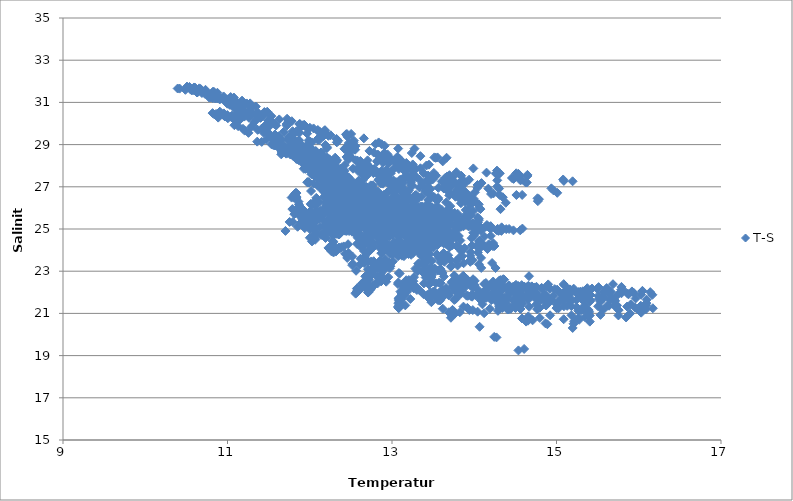
| Category | T-S |
|---|---|
| 13.409 | 22.701 |
| 13.572 | 22.458 |
| 13.0838 | 22.913 |
| 12.903 | 23.056 |
| 12.7436 | 23.09 |
| 12.7075 | 23.091 |
| 12.6064 | 23.305 |
| 12.7715 | 23.364 |
| 12.6666 | 23.673 |
| 12.694 | 23.87 |
| 12.2824 | 24.246 |
| 12.5763 | 24.289 |
| 12.8362 | 23.158 |
| 12.8644 | 22.871 |
| 12.82 | 22.744 |
| 12.7036 | 22.758 |
| 12.563 | 23.02 |
| 12.5159 | 23.287 |
| 12.5223 | 23.356 |
| 12.1682 | 24.832 |
| 12.0637 | 25.35 |
| 12.0056 | 25.59 |
| 11.9125 | 25.921 |
| 11.8768 | 26.061 |
| 11.8678 | 26.167 |
| 11.8635 | 26.295 |
| 11.8381 | 26.476 |
| 11.8307 | 26.556 |
| 11.8083 | 26.607 |
| 11.839 | 26.704 |
| 11.8273 | 26.706 |
| 11.8356 | 26.468 |
| 11.8375 | 26.52 |
| 11.7795 | 26.489 |
| 11.8226 | 26.678 |
| 11.8093 | 26.482 |
| 12.0367 | 25.236 |
| 11.9901 | 25.272 |
| 11.9508 | 25.2 |
| 11.9398 | 25.04 |
| 12.0069 | 24.974 |
| 12.139 | 24.717 |
| 12.1918 | 24.574 |
| 12.2875 | 24.39 |
| 12.4124 | 24.175 |
| 12.4712 | 23.872 |
| 12.6187 | 23.588 |
| 12.6915 | 23.533 |
| 12.8362 | 23.319 |
| 13.3268 | 23.073 |
| 12.855 | 23.5 |
| 12.7112 | 23.453 |
| 12.6486 | 23.594 |
| 12.7772 | 23.473 |
| 12.8844 | 23.348 |
| 12.4559 | 23.628 |
| 12.5179 | 23.699 |
| 12.4301 | 23.824 |
| 12.3174 | 23.931 |
| 12.2892 | 23.888 |
| 12.2645 | 23.939 |
| 12.2272 | 24.102 |
| 12.0661 | 24.49 |
| 12.0274 | 24.411 |
| 12.0654 | 24.57 |
| 12.0501 | 24.685 |
| 12.0012 | 24.584 |
| 12.0688 | 24.884 |
| 12.0643 | 25.09 |
| 12.045 | 25.094 |
| 12.0593 | 25.646 |
| 12.0115 | 25.751 |
| 12.0084 | 25.839 |
| 12.0121 | 25.868 |
| 12.0154 | 26.156 |
| 12.0129 | 26.192 |
| 12.0367 | 26.217 |
| 12.0601 | 26.108 |
| 12.0728 | 26.196 |
| 12.0963 | 26.214 |
| 12.0963 | 26.3 |
| 12.1086 | 26.259 |
| 12.1987 | 26.262 |
| 12.2252 | 26.249 |
| 12.2954 | 25.29 |
| 12.4591 | 25.188 |
| 12.6641 | 25.055 |
| 12.8027 | 24.792 |
| 13.0767 | 24.889 |
| 12.8708 | 24.772 |
| 13.0058 | 24.717 |
| 13.0937 | 24.453 |
| 13.2402 | 24.041 |
| 13.2675 | 24.233 |
| 13.5831 | 23.657 |
| 13.7805 | 23.483 |
| 13.954 | 23.531 |
| 13.8544 | 23.716 |
| 13.9545 | 23.901 |
| 13.6991 | 24.135 |
| 14.0431 | 23.886 |
| 13.8446 | 23.941 |
| 13.9529 | 23.732 |
| 13.9798 | 23.52 |
| 14.0579 | 23.325 |
| 13.8198 | 23.648 |
| 13.57 | 23.628 |
| 13.8714 | 23.379 |
| 13.6184 | 23.521 |
| 13.3999 | 23.879 |
| 13.5029 | 24.128 |
| 13.6584 | 24.289 |
| 13.8018 | 24.144 |
| 13.4634 | 24.073 |
| 13.2772 | 24.07 |
| 13.3752 | 24.047 |
| 12.9085 | 24.828 |
| 12.7434 | 25.084 |
| 12.4664 | 25.694 |
| 12.2495 | 26.205 |
| 12.2199 | 26.25 |
| 12.166 | 26.489 |
| 12.1891 | 26.589 |
| 12.1731 | 26.951 |
| 12.1782 | 27.193 |
| 12.1823 | 27.435 |
| 12.1573 | 27.35 |
| 12.1464 | 27.522 |
| 12.0897 | 27.674 |
| 12.0826 | 28.141 |
| 12.0743 | 28.04 |
| 12.0743 | 27.923 |
| 12.0207 | 27.593 |
| 12.0307 | 27.794 |
| 12.0993 | 27.624 |
| 12.521 | 25.625 |
| 12.4264 | 25.455 |
| 12.4159 | 25.756 |
| 12.5065 | 25.307 |
| 12.509 | 25.351 |
| 12.5445 | 25.276 |
| 12.7227 | 24.927 |
| 13.1159 | 24.231 |
| 13.6274 | 23.858 |
| 14.083 | 23.63 |
| 14.2171 | 23.388 |
| 13.9516 | 23.445 |
| 13.5439 | 23.803 |
| 13.3075 | 24.108 |
| 13.3603 | 24.001 |
| 13.4058 | 23.915 |
| 13.3403 | 24.016 |
| 13.3509 | 23.981 |
| 13.2818 | 24.105 |
| 13.1695 | 24.284 |
| 13.2977 | 24.046 |
| 13.352 | 23.92 |
| 13.2012 | 23.813 |
| 13.1453 | 23.713 |
| 13.0993 | 23.805 |
| 12.7692 | 24.134 |
| 12.7688 | 24.126 |
| 12.8494 | 24.114 |
| 12.6836 | 24.343 |
| 12.856 | 24.703 |
| 12.7524 | 24.937 |
| 12.7242 | 24.755 |
| 12.6186 | 25.209 |
| 12.5089 | 25.594 |
| 12.6331 | 25.236 |
| 12.4211 | 26.025 |
| 12.3688 | 26.321 |
| 12.3643 | 26.343 |
| 12.3284 | 26.515 |
| 12.3202 | 26.697 |
| 12.2262 | 27.008 |
| 12.1902 | 27.206 |
| 12.199 | 27.29 |
| 12.181 | 27.372 |
| 12.3162 | 27.348 |
| 12.3308 | 27.412 |
| 12.3472 | 27.358 |
| 12.37 | 27.331 |
| 12.3191 | 27.4 |
| 12.9522 | 25.401 |
| 13.0083 | 25.428 |
| 12.9715 | 25.498 |
| 13.1584 | 25.49 |
| 13.3809 | 25.256 |
| 13.4217 | 25.546 |
| 13.4759 | 25.281 |
| 13.7803 | 24.718 |
| 14.0576 | 24.43 |
| 14.2278 | 24.184 |
| 14.2458 | 24.194 |
| 14.2298 | 24.331 |
| 14.1232 | 24.641 |
| 14.0803 | 24.914 |
| 14.2845 | 25.008 |
| 14.3886 | 24.994 |
| 14.0775 | 24.121 |
| 14.1752 | 24.272 |
| 14.1855 | 24.226 |
| 14.1016 | 24.234 |
| 13.9714 | 24.213 |
| 13.7837 | 24.202 |
| 13.7297 | 24.225 |
| 13.8311 | 24.456 |
| 14.2017 | 24.674 |
| 13.4125 | 24.682 |
| 13.2257 | 24.918 |
| 13.4931 | 24.875 |
| 13.7298 | 24.513 |
| 13.5809 | 24.718 |
| 13.1944 | 25.557 |
| 13.3599 | 25 |
| 13.2177 | 25.262 |
| 12.5254 | 26.655 |
| 12.4851 | 26.764 |
| 12.3509 | 27.158 |
| 12.3091 | 27.406 |
| 12.2392 | 27.623 |
| 12.1757 | 27.929 |
| 12.1757 | 28.071 |
| 12.1566 | 28.251 |
| 12.0495 | 28.652 |
| 11.8934 | 28.922 |
| 11.7914 | 29.138 |
| 11.7335 | 29.246 |
| 11.867 | 28.92 |
| 11.8678 | 28.958 |
| 11.8932 | 28.732 |
| 11.9965 | 28.692 |
| 12.7379 | 26.354 |
| 12.548 | 26.621 |
| 12.5992 | 26.511 |
| 12.6339 | 26.462 |
| 12.7179 | 26.137 |
| 12.7649 | 26.05 |
| 12.7571 | 26.013 |
| 13.0163 | 25.417 |
| 13.3473 | 24.767 |
| 13.7029 | 24.261 |
| 13.882 | 24.094 |
| 13.8191 | 24.125 |
| 13.4586 | 24.761 |
| 13.3855 | 24.905 |
| 13.5757 | 24.604 |
| 13.4717 | 24.435 |
| 13.4442 | 24.52 |
| 13.6241 | 23.584 |
| 13.3572 | 24.446 |
| 13.4112 | 24.198 |
| 13.4333 | 23.96 |
| 13.3761 | 24.06 |
| 13.7081 | 23.533 |
| 13.6835 | 23.754 |
| 13.4479 | 23.788 |
| 13.3734 | 23.78 |
| 13.3728 | 23.955 |
| 13.4395 | 24.026 |
| 13.3034 | 24.234 |
| 13.0813 | 24.662 |
| 13.237 | 24.6 |
| 13.2712 | 24.545 |
| 13.0789 | 24.89 |
| 12.93 | 25.393 |
| 12.7942 | 25.748 |
| 12.7315 | 25.972 |
| 12.6768 | 26.181 |
| 12.5413 | 26.674 |
| 12.4646 | 26.946 |
| 12.4267 | 27.07 |
| 12.3032 | 27.407 |
| 12.1772 | 27.681 |
| 12.0595 | 27.975 |
| 12.04 | 28.1 |
| 11.933 | 28.335 |
| 12.0095 | 28.297 |
| 12.0291 | 28.268 |
| 12.2607 | 27.91 |
| 12.2716 | 28 |
| 12.2266 | 28.125 |
| 12.3743 | 27.787 |
| 12.9617 | 25.961 |
| 13.092 | 25.729 |
| 13.2128 | 25.731 |
| 13.3432 | 25.488 |
| 13.3972 | 25.706 |
| 13.4955 | 25.545 |
| 13.6529 | 25.13 |
| 13.8125 | 24.667 |
| 14.0242 | 24.199 |
| 14.161 | 24.049 |
| 14.1239 | 24.211 |
| 14.0627 | 24.435 |
| 13.9869 | 24.822 |
| 14.0452 | 25.017 |
| 14.0666 | 25.081 |
| 14.0107 | 25.11 |
| 13.9323 | 25.119 |
| 14.0089 | 24.793 |
| 13.997 | 24.684 |
| 13.9678 | 24.563 |
| 13.7782 | 24.594 |
| 13.4758 | 24.641 |
| 13.5906 | 24.74 |
| 13.5024 | 24.885 |
| 13.4717 | 25.043 |
| 13.3834 | 25.142 |
| 13.5734 | 25.46 |
| 13.6187 | 24.985 |
| 13.4312 | 25.315 |
| 13.1702 | 25.873 |
| 13.0772 | 25.945 |
| 12.4745 | 27.16 |
| 12.297 | 27.586 |
| 12.2598 | 27.73 |
| 12.2089 | 27.905 |
| 12.1334 | 28.092 |
| 12.0553 | 28.298 |
| 11.9881 | 28.508 |
| 11.929 | 28.719 |
| 11.8539 | 28.936 |
| 11.7736 | 29.034 |
| 11.5768 | 29.48 |
| 11.4886 | 29.592 |
| 11.626 | 29.345 |
| 11.6221 | 29.393 |
| 11.6615 | 29.214 |
| 11.7812 | 28.994 |
| 12.4483 | 27.011 |
| 12.2641 | 27.325 |
| 12.2696 | 27.3 |
| 12.3793 | 26.948 |
| 12.4008 | 26.752 |
| 12.5665 | 26.426 |
| 12.6661 | 26.102 |
| 12.7516 | 25.666 |
| 13.1284 | 24.793 |
| 13.3222 | 24.626 |
| 12.9885 | 25.703 |
| 13.0122 | 25.509 |
| 12.9391 | 25.543 |
| 13.205 | 25.187 |
| 13.1422 | 25.134 |
| 13.184 | 24.684 |
| 13.0071 | 25.323 |
| 13.2377 | 24.379 |
| 13.3209 | 23.884 |
| 13.2133 | 24.122 |
| 13.2162 | 24.16 |
| 13.1848 | 24.282 |
| 13.201 | 24.171 |
| 13.2564 | 23.862 |
| 13.33 | 23.37 |
| 13.2332 | 23.777 |
| 13.1806 | 23.838 |
| 13.207 | 23.851 |
| 13.1988 | 23.864 |
| 13.1539 | 24.073 |
| 13.0919 | 24.41 |
| 13.1073 | 24.302 |
| 12.9642 | 24.857 |
| 12.8741 | 25.252 |
| 12.9032 | 25.218 |
| 12.8202 | 25.522 |
| 12.7364 | 25.928 |
| 12.5946 | 26.407 |
| 12.4445 | 26.849 |
| 12.3664 | 27.068 |
| 12.0648 | 27.763 |
| 12.077 | 27.762 |
| 11.8375 | 28.32 |
| 11.7277 | 28.6 |
| 11.6672 | 28.709 |
| 11.6729 | 28.742 |
| 11.652 | 28.865 |
| 11.563 | 29.084 |
| 11.6349 | 28.983 |
| 11.6975 | 28.934 |
| 11.6973 | 28.865 |
| 12.6698 | 26.292 |
| 12.7644 | 26.118 |
| 12.762 | 26.298 |
| 12.8774 | 26.075 |
| 13.0227 | 25.757 |
| 13.0127 | 25.913 |
| 13.0499 | 25.886 |
| 13.328 | 25.187 |
| 13.407 | 24.929 |
| 13.528 | 24.532 |
| 13.6291 | 24.319 |
| 13.6251 | 24.472 |
| 13.6186 | 24.703 |
| 13.6319 | 24.87 |
| 13.516 | 25.315 |
| 13.6286 | 25.172 |
| 13.612 | 25.191 |
| 13.4317 | 25.313 |
| 13.5692 | 25.236 |
| 13.5968 | 25.2 |
| 13.5179 | 24.492 |
| 13.435 | 24.525 |
| 13.4045 | 24.555 |
| 13.294 | 24.635 |
| 13.464 | 24.906 |
| 13.2622 | 25.07 |
| 13.1629 | 25.243 |
| 13.2407 | 25.781 |
| 12.9994 | 25.727 |
| 12.9114 | 26.043 |
| 12.8021 | 26.205 |
| 12.2882 | 27.212 |
| 12.1438 | 27.668 |
| 11.9446 | 28.297 |
| 11.8377 | 28.568 |
| 11.6277 | 29.119 |
| 11.4426 | 29.548 |
| 11.2862 | 29.826 |
| 11.1141 | 30.122 |
| 11.0816 | 30.184 |
| 11.0044 | 30.3 |
| 10.9544 | 30.382 |
| 10.9152 | 30.438 |
| 10.8997 | 30.472 |
| 10.9014 | 30.468 |
| 10.9689 | 30.337 |
| 11.0045 | 30.248 |
| 12.2066 | 27.347 |
| 12.0341 | 27.82 |
| 11.9605 | 28.057 |
| 11.9987 | 27.921 |
| 12.1301 | 27.482 |
| 12.2242 | 27.253 |
| 12.496 | 26.476 |
| 12.7478 | 25.616 |
| 12.9054 | 25.007 |
| 12.7958 | 24.999 |
| 12.7896 | 25.172 |
| 12.6334 | 26.06 |
| 12.607 | 25.848 |
| 12.4204 | 26.217 |
| 12.7827 | 25.074 |
| 12.8031 | 25.053 |
| 12.9183 | 24.375 |
| 12.8657 | 24.633 |
| 12.8601 | 24.294 |
| 12.8913 | 24.22 |
| 12.8552 | 24.408 |
| 12.9163 | 24.027 |
| 12.8965 | 24.071 |
| 12.9085 | 24.019 |
| 12.9756 | 23.828 |
| 13.0534 | 23.823 |
| 13.1085 | 23.858 |
| 13.0399 | 23.963 |
| 12.9573 | 24.048 |
| 12.9637 | 24.228 |
| 12.847 | 24.827 |
| 12.9028 | 24.542 |
| 12.6796 | 25.549 |
| 12.6546 | 25.596 |
| 12.703 | 25.502 |
| 12.6033 | 25.867 |
| 12.5389 | 26.263 |
| 12.3506 | 26.865 |
| 12.2145 | 27.264 |
| 12.0956 | 27.616 |
| 11.6535 | 28.538 |
| 11.6574 | 28.653 |
| 11.4164 | 29.128 |
| 11.6851 | 28.742 |
| 11.255 | 29.556 |
| 11.0837 | 29.919 |
| 10.8868 | 30.279 |
| 10.8422 | 30.426 |
| 10.8184 | 30.493 |
| 10.8609 | 30.452 |
| 10.9684 | 30.33 |
| 11.0877 | 30.223 |
| 11.1205 | 30.163 |
| 12.5768 | 26.714 |
| 12.7019 | 26.67 |
| 12.7751 | 26.686 |
| 12.7419 | 26.855 |
| 12.9399 | 26.733 |
| 13.0293 | 26.6 |
| 13.4598 | 25.77 |
| 13.6478 | 25.332 |
| 13.7544 | 25.137 |
| 13.8398 | 25.109 |
| 13.3189 | 26.019 |
| 13.1621 | 26.4 |
| 13.2735 | 26.386 |
| 13.2935 | 26.348 |
| 13.2728 | 26.391 |
| 13.3719 | 25.784 |
| 13.4675 | 25.636 |
| 13.4922 | 25.56 |
| 13.427 | 25.657 |
| 13.412 | 25.646 |
| 13.307 | 25.014 |
| 13.1271 | 25.414 |
| 13.0499 | 25.576 |
| 12.9517 | 25.77 |
| 12.6308 | 26.326 |
| 13.094 | 26.227 |
| 12.9773 | 26.338 |
| 12.6305 | 26.846 |
| 12.3516 | 27.605 |
| 12.153 | 27.33 |
| 11.9126 | 28.115 |
| 11.6893 | 28.877 |
| 11.5852 | 29.147 |
| 11.4873 | 29.552 |
| 11.4159 | 29.76 |
| 11.3073 | 29.909 |
| 11.144 | 30.156 |
| 11.0601 | 30.297 |
| 10.9979 | 30.401 |
| 10.9551 | 30.479 |
| 10.9059 | 30.552 |
| 10.9051 | 30.551 |
| 10.9051 | 30.551 |
| 11.2085 | 29.663 |
| 11.1295 | 29.874 |
| 11.1883 | 29.75 |
| 11.3615 | 29.141 |
| 11.9494 | 27.85 |
| 12.0246 | 27.762 |
| 11.9276 | 27.855 |
| 11.9683 | 27.875 |
| 11.9846 | 27.906 |
| 12.277 | 27.01 |
| 12.5823 | 26.035 |
| 12.5683 | 25.706 |
| 12.4094 | 26.456 |
| 12.4386 | 26.232 |
| 12.3549 | 26.462 |
| 12.3486 | 26.464 |
| 12.2743 | 26.467 |
| 12.1799 | 26.829 |
| 12.3708 | 26.062 |
| 12.6123 | 25.463 |
| 12.5039 | 25.819 |
| 12.5577 | 25.633 |
| 12.6445 | 25.354 |
| 12.6659 | 25.238 |
| 12.6274 | 25.23 |
| 12.663 | 25.023 |
| 12.7472 | 24.629 |
| 12.9418 | 24.232 |
| 13.0478 | 24.22 |
| 13.1049 | 24.235 |
| 13.0231 | 24.358 |
| 13.0584 | 24.429 |
| 12.9783 | 24.707 |
| 12.8358 | 25.01 |
| 12.6526 | 25.707 |
| 12.5977 | 25.861 |
| 12.5426 | 26.009 |
| 12.558 | 26.135 |
| 12.3586 | 26.719 |
| 12.4146 | 26.72 |
| 12.1821 | 27.371 |
| 12.1057 | 27.694 |
| 11.7993 | 28.458 |
| 11.9175 | 28.484 |
| 11.4727 | 29.237 |
| 11.5308 | 29.334 |
| 11.3668 | 29.699 |
| 11.1154 | 30.087 |
| 11.0496 | 30.291 |
| 11.0515 | 30.364 |
| 11.0662 | 30.364 |
| 11.0952 | 30.349 |
| 11.1154 | 30.356 |
| 11.1639 | 30.335 |
| 11.1957 | 30.328 |
| 11.2056 | 30.33 |
| 11.4907 | 30.157 |
| 12.3221 | 28.184 |
| 12.4474 | 28.416 |
| 12.5355 | 28.788 |
| 12.941 | 28.201 |
| 13.1874 | 27.948 |
| 13.3461 | 27.878 |
| 13.8394 | 27.189 |
| 14.2044 | 26.66 |
| 14.3834 | 26.243 |
| 13.9965 | 26.421 |
| 13.7871 | 26.804 |
| 13.7991 | 26.866 |
| 13.6436 | 26.927 |
| 13.7078 | 26.956 |
| 13.7613 | 26.62 |
| 13.8681 | 26.582 |
| 13.8608 | 26.544 |
| 13.8512 | 26.545 |
| 13.6594 | 26.259 |
| 13.2353 | 25.994 |
| 13.0763 | 26.07 |
| 12.9998 | 26.209 |
| 13.0126 | 26.528 |
| 12.5234 | 27.241 |
| 13.4245 | 27.319 |
| 13.2182 | 27.445 |
| 12.6585 | 27.55 |
| 12.4258 | 28.026 |
| 12.2399 | 28.305 |
| 11.8687 | 29.212 |
| 11.6839 | 29.606 |
| 11.5916 | 29.904 |
| 11.5312 | 30.129 |
| 11.517 | 30.133 |
| 11.4 | 30.266 |
| 11.2941 | 30.46 |
| 11.1836 | 30.632 |
| 11.1255 | 30.738 |
| 11.1038 | 30.766 |
| 11.085 | 30.784 |
| 11.0664 | 30.789 |
| 11.1858 | 30.563 |
| 11.3459 | 30.175 |
| 11.4611 | 29.919 |
| 11.2652 | 30.473 |
| 11.5099 | 29.871 |
| 12.0584 | 28.647 |
| 12.0238 | 28.784 |
| 12.2096 | 28.398 |
| 12.3322 | 28.262 |
| 12.526 | 27.858 |
| 12.8639 | 27.154 |
| 13.1799 | 26.353 |
| 13.1545 | 26.531 |
| 13.0634 | 27.073 |
| 12.9886 | 27.161 |
| 12.9758 | 27.11 |
| 12.9039 | 27.248 |
| 13.0547 | 26.848 |
| 13.4083 | 25.844 |
| 13.0072 | 26.862 |
| 13.1294 | 26.543 |
| 13.534 | 25.409 |
| 13.4771 | 25.514 |
| 13.5361 | 25.295 |
| 13.5373 | 25.302 |
| 13.5813 | 25.121 |
| 13.5707 | 25.048 |
| 13.6159 | 24.696 |
| 13.655 | 24.344 |
| 13.5946 | 24.375 |
| 13.5337 | 24.459 |
| 13.5346 | 24.621 |
| 13.2892 | 25.27 |
| 13.3995 | 25.01 |
| 13.1555 | 25.7 |
| 13.2446 | 25.63 |
| 13.0645 | 26.149 |
| 13.0364 | 26.21 |
| 12.8641 | 26.605 |
| 12.6889 | 26.994 |
| 12.6001 | 27.313 |
| 12.4108 | 27.803 |
| 12.1822 | 28.413 |
| 11.8697 | 29.026 |
| 11.8642 | 29.185 |
| 11.3247 | 30.068 |
| 11.2607 | 30.272 |
| 11.1675 | 30.463 |
| 11.5363 | 30.054 |
| 11.1237 | 30.572 |
| 11.1419 | 30.549 |
| 11.1959 | 30.551 |
| 11.217 | 30.532 |
| 11.2456 | 30.527 |
| 11.3057 | 30.497 |
| 11.3645 | 30.476 |
| 11.3699 | 30.508 |
| 11.4482 | 30.542 |
| 12.4978 | 28.684 |
| 12.828 | 28.528 |
| 13.1744 | 28.131 |
| 13.2404 | 28.602 |
| 13.3455 | 28.453 |
| 13.4493 | 28.049 |
| 14.088 | 27.176 |
| 14.3019 | 26.916 |
| 14.3088 | 26.614 |
| 13.8351 | 26.992 |
| 13.6982 | 27.27 |
| 13.6433 | 27.243 |
| 13.7547 | 27.239 |
| 13.9372 | 27.337 |
| 13.8706 | 27.295 |
| 13.7302 | 27.185 |
| 13.7768 | 27.133 |
| 14.0084 | 26.741 |
| 13.7715 | 26.53 |
| 13.5212 | 26.462 |
| 13.32 | 26.503 |
| 13.1724 | 26.584 |
| 13.0115 | 27.171 |
| 13.7829 | 27.689 |
| 13.2803 | 27.889 |
| 12.6164 | 28.222 |
| 12.4217 | 28.798 |
| 12.0978 | 29.223 |
| 11.8751 | 29.572 |
| 11.7183 | 29.974 |
| 11.5345 | 30.346 |
| 11.2774 | 30.776 |
| 11.1944 | 30.88 |
| 11.1371 | 30.955 |
| 11.1205 | 30.984 |
| 11.0764 | 31.032 |
| 11.018 | 31.091 |
| 10.9204 | 31.179 |
| 10.8326 | 31.278 |
| 10.7752 | 31.341 |
| 10.9534 | 31.133 |
| 11.0845 | 30.852 |
| 11.1766 | 30.697 |
| 11.068 | 30.999 |
| 11.1179 | 30.852 |
| 12.0245 | 29.104 |
| 11.9862 | 29.195 |
| 12.0052 | 29.141 |
| 12.2073 | 28.825 |
| 12.19 | 28.98 |
| 12.6227 | 28.032 |
| 12.7736 | 27.65 |
| 13.0339 | 26.841 |
| 12.9881 | 26.864 |
| 12.8742 | 27.597 |
| 12.834 | 27.561 |
| 12.7387 | 27.73 |
| 13.1708 | 26.672 |
| 13.0671 | 26.895 |
| 12.9184 | 27.248 |
| 13.2605 | 26.447 |
| 13.4496 | 25.933 |
| 13.4581 | 25.888 |
| 13.5302 | 25.522 |
| 13.5128 | 25.354 |
| 13.5629 | 25.412 |
| 13.5545 | 25.388 |
| 13.5757 | 25.376 |
| 13.6543 | 25.223 |
| 13.7288 | 24.7 |
| 13.7251 | 24.725 |
| 13.6917 | 24.906 |
| 13.6475 | 25.13 |
| 13.3103 | 25.888 |
| 13.474 | 25.583 |
| 13.512 | 25.72 |
| 13.2626 | 26.328 |
| 13.1873 | 26.603 |
| 13.1174 | 26.733 |
| 13.1921 | 26.75 |
| 12.8342 | 27.312 |
| 12.5867 | 27.902 |
| 12.4705 | 28.292 |
| 12.2111 | 28.875 |
| 11.8215 | 29.56 |
| 11.569 | 29.981 |
| 11.4091 | 30.297 |
| 11.0557 | 30.903 |
| 11.1086 | 30.867 |
| 11.3687 | 30.501 |
| 10.9829 | 31.012 |
| 11.0175 | 30.971 |
| 11.0146 | 30.957 |
| 11.0172 | 30.941 |
| 11.059 | 30.916 |
| 11.0578 | 30.921 |
| 11.0712 | 30.915 |
| 11.1387 | 30.914 |
| 11.2753 | 30.953 |
| 12.5344 | 28.853 |
| 12.9008 | 28.491 |
| 12.9097 | 28.586 |
| 13.0942 | 28.317 |
| 13.515 | 28.393 |
| 13.6169 | 28.204 |
| 14.2797 | 27.306 |
| 14.2799 | 27.015 |
| 14.5826 | 26.614 |
| 14.0399 | 27.087 |
| 13.8887 | 27.174 |
| 13.5372 | 27.53 |
| 13.699 | 27.55 |
| 13.7416 | 27.466 |
| 13.6478 | 27.425 |
| 13.8382 | 27.244 |
| 13.8129 | 27.173 |
| 13.79 | 27.104 |
| 13.6284 | 26.934 |
| 13.2311 | 27.078 |
| 13.4473 | 27.217 |
| 13.2946 | 27.466 |
| 12.9338 | 27.802 |
| 13.1283 | 28.046 |
| 12.8191 | 28.196 |
| 12.7033 | 28.254 |
| 12.1687 | 29.412 |
| 11.968 | 29.521 |
| 11.6294 | 30.194 |
| 11.4524 | 30.52 |
| 11.2946 | 30.77 |
| 11.0057 | 31.145 |
| 10.9499 | 31.206 |
| 10.8821 | 31.277 |
| 10.8137 | 31.348 |
| 10.6891 | 31.445 |
| 10.6369 | 31.481 |
| 10.4881 | 31.595 |
| 10.4176 | 31.654 |
| 10.394 | 31.658 |
| 10.6284 | 31.471 |
| 10.6314 | 31.479 |
| 10.9983 | 30.939 |
| 10.7832 | 31.351 |
| 10.9054 | 31.141 |
| 11.7913 | 29.634 |
| 11.8372 | 29.63 |
| 11.8542 | 29.627 |
| 12.1166 | 29.224 |
| 12.101 | 29.279 |
| 12.4822 | 28.497 |
| 12.6997 | 28.068 |
| 13.0452 | 27.19 |
| 12.8938 | 27.511 |
| 12.6865 | 28.054 |
| 12.5551 | 28.257 |
| 12.5794 | 28.244 |
| 12.6717 | 28.05 |
| 12.9238 | 27.518 |
| 12.7182 | 27.96 |
| 12.8452 | 27.672 |
| 13.0204 | 27.296 |
| 13.1224 | 26.987 |
| 13.2039 | 26.826 |
| 13.292 | 26.614 |
| 13.4565 | 26.112 |
| 13.4882 | 26.029 |
| 13.5345 | 25.953 |
| 13.6449 | 25.414 |
| 13.699 | 25.279 |
| 13.675 | 25.323 |
| 13.5917 | 25.538 |
| 13.5267 | 25.745 |
| 13.2183 | 26.365 |
| 13.4202 | 26.161 |
| 13.4438 | 26.37 |
| 13.3594 | 26.537 |
| 13.0499 | 27.22 |
| 12.8767 | 27.446 |
| 13.1088 | 27.337 |
| 12.7863 | 27.855 |
| 12.496 | 28.408 |
| 12.4574 | 28.682 |
| 12.1048 | 29.304 |
| 11.7206 | 29.897 |
| 11.3574 | 30.351 |
| 11.0282 | 30.884 |
| 11.0077 | 31.038 |
| 10.7773 | 31.233 |
| 10.7965 | 31.231 |
| 10.8219 | 31.204 |
| 10.8516 | 31.185 |
| 10.8728 | 31.198 |
| 10.8816 | 31.202 |
| 10.8875 | 31.209 |
| 10.8886 | 31.223 |
| 10.9455 | 31.191 |
| 10.9623 | 31.196 |
| 12.1791 | 29.663 |
| 12.5371 | 29.184 |
| 12.8735 | 29.017 |
| 12.9112 | 28.946 |
| 13.0751 | 28.812 |
| 13.2736 | 28.808 |
| 13.5535 | 28.392 |
| 13.6634 | 28.377 |
| 14.51 | 27.64 |
| 14.4782 | 27.374 |
| 14.9377 | 26.926 |
| 14.9629 | 26.831 |
| 15.009 | 26.715 |
| 14.6388 | 27.203 |
| 14.5795 | 27.326 |
| 14.56 | 27.312 |
| 14.6257 | 27.205 |
| 14.4586 | 27.417 |
| 14.2622 | 27.627 |
| 14.3039 | 27.624 |
| 13.6712 | 27.491 |
| 13.5089 | 27.658 |
| 13.0839 | 27.842 |
| 12.8284 | 28.259 |
| 13.0659 | 28.423 |
| 12.7991 | 29.021 |
| 12.4844 | 28.874 |
| 12.0464 | 29.766 |
| 11.7407 | 30.112 |
| 11.4833 | 30.557 |
| 11.3449 | 30.801 |
| 11.2339 | 30.95 |
| 11.0385 | 31.253 |
| 10.8774 | 31.458 |
| 10.8343 | 31.5 |
| 10.8219 | 31.502 |
| 10.7326 | 31.598 |
| 10.6568 | 31.664 |
| 10.5924 | 31.708 |
| 10.5378 | 31.733 |
| 10.5075 | 31.75 |
| 10.605 | 31.686 |
| 10.6733 | 31.635 |
| 10.6053 | 31.691 |
| 12.3293 | 29.106 |
| 11.9617 | 29.796 |
| 11.8743 | 29.969 |
| 11.9165 | 29.913 |
| 11.8806 | 29.973 |
| 12.163 | 29.567 |
| 12.1192 | 29.618 |
| 12.4745 | 29.074 |
| 12.5554 | 28.928 |
| 12.9981 | 28.282 |
| 13.2394 | 27.841 |
| 12.8988 | 28.574 |
| 12.9544 | 28.436 |
| 12.9179 | 28.522 |
| 13.0686 | 28.162 |
| 12.9 | 28.509 |
| 13.0251 | 28.214 |
| 13.1263 | 28.026 |
| 13.2617 | 27.766 |
| 13.4944 | 27.348 |
| 13.6818 | 26.961 |
| 13.7808 | 26.742 |
| 13.8758 | 26.562 |
| 13.9269 | 26.462 |
| 14.0158 | 26.274 |
| 14.0749 | 25.943 |
| 13.9837 | 25.838 |
| 13.8965 | 25.902 |
| 13.9305 | 25.923 |
| 13.838 | 26.222 |
| 13.4112 | 26.911 |
| 13.6958 | 26.591 |
| 13.3683 | 27.145 |
| 13.5639 | 26.95 |
| 13.1548 | 27.741 |
| 13.1688 | 27.742 |
| 13.0292 | 27.877 |
| 12.8896 | 28.134 |
| 12.552 | 28.759 |
| 12.3455 | 29.181 |
| 12.0973 | 29.646 |
| 11.9327 | 29.941 |
| 11.4653 | 30.494 |
| 11.1919 | 30.847 |
| 10.9569 | 31.155 |
| 10.7243 | 31.41 |
| 10.6177 | 31.529 |
| 10.565 | 31.576 |
| 10.5522 | 31.605 |
| 10.5629 | 31.609 |
| 10.5725 | 31.599 |
| 10.5749 | 31.596 |
| 10.5869 | 31.594 |
| 10.5949 | 31.593 |
| 10.5935 | 31.593 |
| 13.4187 | 28.009 |
| 12.1849 | 29.684 |
| 12.459 | 29.37 |
| 12.4403 | 29.483 |
| 12.4519 | 29.502 |
| 12.5035 | 29.505 |
| 12.6578 | 29.296 |
| 12.8378 | 29.102 |
| 13.5316 | 28.375 |
| 13.9887 | 27.87 |
| 14.1494 | 27.671 |
| 14.3103 | 27.643 |
| 14.6462 | 27.514 |
| 15.0896 | 27.28 |
| 15.1957 | 27.26 |
| 15.081 | 27.346 |
| 14.6462 | 27.566 |
| 14.5365 | 27.615 |
| 14.549 | 27.545 |
| 14.2762 | 27.768 |
| 13.8414 | 27.525 |
| 13.2861 | 27.832 |
| 13.2526 | 28.06 |
| 12.9458 | 28.538 |
| 12.7787 | 28.623 |
| 12.5311 | 29.108 |
| 12.5109 | 29.072 |
| 12.2545 | 29.442 |
| 11.9384 | 29.904 |
| 11.7242 | 30.224 |
| 11.2631 | 30.9 |
| 11.1769 | 31.084 |
| 11.0775 | 31.23 |
| 10.9531 | 31.282 |
| 11.0032 | 31.044 |
| 11.0768 | 30.804 |
| 11.1278 | 30.645 |
| 11.1589 | 30.55 |
| 11.1624 | 30.532 |
| 11.1675 | 30.521 |
| 11.1674 | 30.523 |
| 11.1877 | 30.465 |
| 11.1869 | 30.472 |
| 11.1847 | 30.485 |
| 11.1847 | 30.488 |
| 11.1763 | 30.526 |
| 12.3253 | 29.271 |
| 12.2267 | 29.416 |
| 11.8994 | 29.871 |
| 11.7818 | 30.108 |
| 12.0018 | 29.798 |
| 12.0983 | 29.691 |
| 12.5259 | 28.945 |
| 12.8335 | 28.483 |
| 13.1483 | 28.015 |
| 13.2755 | 27.864 |
| 13.2103 | 27.975 |
| 13.1245 | 28.182 |
| 13.4392 | 27.533 |
| 13.6042 | 27.254 |
| 13.6622 | 27.134 |
| 13.8923 | 26.754 |
| 13.8503 | 26.813 |
| 13.9484 | 26.552 |
| 13.687 | 27.067 |
| 13.842 | 26.724 |
| 13.8611 | 26.622 |
| 13.8977 | 26.528 |
| 13.9183 | 26.502 |
| 14.0549 | 26.168 |
| 13.9746 | 26.206 |
| 13.9433 | 26.192 |
| 13.8877 | 26.291 |
| 13.8199 | 26.445 |
| 13.6922 | 26.742 |
| 13.6305 | 26.918 |
| 13.6408 | 27.012 |
| 13.7113 | 27.023 |
| 13.4886 | 27.413 |
| 13.2428 | 27.757 |
| 13.093 | 28.011 |
| 12.9709 | 28.195 |
| 12.9064 | 28.356 |
| 12.7256 | 28.701 |
| 12.4468 | 28.871 |
| 12.3091 | 28.38 |
| 12.2814 | 28.251 |
| 12.2349 | 28.131 |
| 12.208 | 27.99 |
| 12.1908 | 27.892 |
| 12.1941 | 27.705 |
| 12.1962 | 27.574 |
| 12.1967 | 27.507 |
| 12.1828 | 27.491 |
| 12.1695 | 27.457 |
| 12.1723 | 27.468 |
| 12.1688 | 27.476 |
| 12.1606 | 27.491 |
| 12.1245 | 27.566 |
| 12.1707 | 27.446 |
| 12.213 | 27.486 |
| 12.8737 | 27.368 |
| 13.1628 | 27.517 |
| 12.9848 | 27.632 |
| 12.9188 | 27.682 |
| 12.7088 | 27.725 |
| 13.0634 | 28.088 |
| 12.9572 | 28.101 |
| 13.1248 | 28.006 |
| 13.3825 | 27.652 |
| 13.6934 | 27.296 |
| 14.3472 | 26.505 |
| 14.7735 | 26.321 |
| 14.7866 | 26.413 |
| 14.7691 | 26.455 |
| 14.5127 | 26.612 |
| 14.1713 | 26.913 |
| 14.0378 | 26.95 |
| 14.2325 | 26.685 |
| 13.334 | 27.339 |
| 13.2253 | 27.45 |
| 13.1895 | 27.462 |
| 12.9806 | 27.69 |
| 12.8759 | 27.768 |
| 12.7539 | 27.79 |
| 12.7656 | 27.825 |
| 12.6556 | 27.755 |
| 12.5882 | 27.744 |
| 12.424 | 27.759 |
| 12.3263 | 27.784 |
| 12.3575 | 27.821 |
| 12.3801 | 27.804 |
| 12.2584 | 27.763 |
| 12.1951 | 27.634 |
| 12.2267 | 27.005 |
| 12.241 | 26.523 |
| 12.2404 | 26.189 |
| 12.1931 | 25.791 |
| 12.1521 | 25.643 |
| 12.1006 | 25.462 |
| 12.0597 | 25.358 |
| 12.04 | 25.378 |
| 12.1418 | 25.631 |
| 12.1951 | 26.077 |
| 12.1821 | 25.956 |
| 12.1949 | 25.949 |
| 12.2009 | 26.136 |
| 12.2387 | 27.476 |
| 12.6167 | 27.214 |
| 12.6887 | 27.51 |
| 12.7126 | 27.712 |
| 12.6493 | 27.579 |
| 12.8912 | 27.149 |
| 12.9875 | 27.027 |
| 13.1532 | 26.865 |
| 13.2806 | 26.589 |
| 13.1306 | 27.162 |
| 13.2277 | 27.206 |
| 13.268 | 27.418 |
| 13.4227 | 26.783 |
| 13.4219 | 26.895 |
| 13.4642 | 26.891 |
| 13.5054 | 26.534 |
| 13.4603 | 26.906 |
| 13.4452 | 26.814 |
| 13.56 | 26.474 |
| 13.5562 | 26.44 |
| 13.5618 | 26.397 |
| 13.556 | 26.395 |
| 13.5238 | 26.438 |
| 13.4837 | 26.517 |
| 13.4979 | 26.524 |
| 13.4474 | 26.662 |
| 13.4084 | 26.798 |
| 13.3351 | 26.964 |
| 13.2485 | 27.058 |
| 13.1318 | 27.265 |
| 12.9798 | 27.332 |
| 13.1179 | 27.306 |
| 13.0939 | 27.316 |
| 12.9628 | 27.354 |
| 12.9269 | 27.43 |
| 12.8394 | 27.359 |
| 12.6131 | 26.919 |
| 12.4968 | 26.653 |
| 12.3863 | 26.335 |
| 12.315 | 26.179 |
| 12.2984 | 25.92 |
| 12.2487 | 25.493 |
| 12.2124 | 25.251 |
| 12.1735 | 25.153 |
| 12.1235 | 25.079 |
| 12.083 | 24.783 |
| 12.0446 | 25.176 |
| 12.0181 | 25.222 |
| 12.0018 | 25.354 |
| 11.9786 | 25.407 |
| 11.9673 | 25.403 |
| 11.965 | 25.443 |
| 11.9536 | 25.541 |
| 11.9398 | 25.575 |
| 11.9427 | 25.572 |
| 11.9824 | 25.407 |
| 11.9126 | 25.464 |
| 12.248 | 25.657 |
| 12.1196 | 25.49 |
| 12.0731 | 25.412 |
| 12.0708 | 25.404 |
| 12.0593 | 25.382 |
| 12.0408 | 25.319 |
| 12.0019 | 25.275 |
| 11.9702 | 25.26 |
| 11.9342 | 25.316 |
| 11.9197 | 25.314 |
| 11.9004 | 25.334 |
| 11.8956 | 25.299 |
| 11.9042 | 25.313 |
| 11.933 | 25.548 |
| 12.0013 | 25.657 |
| 12.023 | 25.72 |
| 12.0773 | 25.777 |
| 12.0982 | 25.86 |
| 12.1339 | 25.866 |
| 12.0816 | 25.777 |
| 12.0751 | 25.697 |
| 12.153 | 25.759 |
| 12.0568 | 25.606 |
| 12.1505 | 25.753 |
| 12.0001 | 25.47 |
| 11.8989 | 25.314 |
| 11.9037 | 25.283 |
| 11.9899 | 25.384 |
| 11.9204 | 25.258 |
| 11.9123 | 25.337 |
| 11.9742 | 25.425 |
| 11.9848 | 25.437 |
| 11.9907 | 25.481 |
| 12.0216 | 25.571 |
| 11.9916 | 25.702 |
| 11.8247 | 25.887 |
| 11.7882 | 25.945 |
| 11.8266 | 25.848 |
| 11.8523 | 25.776 |
| 11.8081 | 25.875 |
| 11.9654 | 25.575 |
| 11.9172 | 25.445 |
| 11.7941 | 25.33 |
| 11.7553 | 25.334 |
| 11.8125 | 25.704 |
| 11.9023 | 25.832 |
| 11.8603 | 25.757 |
| 11.9259 | 25.781 |
| 11.9203 | 25.913 |
| 11.8606 | 25.687 |
| 11.7047 | 24.908 |
| 11.8523 | 25.106 |
| 12.1491 | 25.655 |
| 12.273 | 25.532 |
| 12.2098 | 25.415 |
| 12.1711 | 25.382 |
| 12.3789 | 25.508 |
| 12.4025 | 25.457 |
| 12.3736 | 25.47 |
| 12.5251 | 25.456 |
| 12.5026 | 25.339 |
| 12.5272 | 25.273 |
| 12.4464 | 25.317 |
| 12.5319 | 25.333 |
| 12.5686 | 25.394 |
| 12.6316 | 25.252 |
| 12.6348 | 25.28 |
| 12.724 | 25.297 |
| 12.6927 | 25.331 |
| 12.7716 | 25.489 |
| 12.8421 | 25.567 |
| 12.8527 | 25.762 |
| 12.8447 | 25.847 |
| 12.7791 | 25.885 |
| 12.7431 | 25.894 |
| 12.7114 | 25.833 |
| 12.6657 | 25.869 |
| 12.7037 | 25.923 |
| 12.5015 | 26.108 |
| 12.3847 | 26.537 |
| 12.3358 | 26.864 |
| 12.2663 | 27.112 |
| 12.2316 | 27.15 |
| 12.2041 | 27.066 |
| 12.207 | 27.034 |
| 12.2179 | 26.996 |
| 12.2207 | 26.949 |
| 12.2198 | 26.885 |
| 12.2154 | 26.859 |
| 12.2036 | 26.824 |
| 12.1887 | 26.805 |
| 12.1825 | 26.786 |
| 12.1716 | 26.772 |
| 12.1734 | 26.771 |
| 12.1701 | 26.775 |
| 12.1822 | 26.805 |
| 12.1798 | 26.834 |
| 12.5388 | 26.182 |
| 12.5879 | 26.031 |
| 12.4434 | 26.266 |
| 12.4317 | 26.276 |
| 12.3806 | 26.364 |
| 12.2637 | 26.668 |
| 12.3931 | 26.389 |
| 12.5025 | 26.152 |
| 12.6201 | 25.95 |
| 13.0784 | 25.375 |
| 13.4266 | 25.053 |
| 13.5699 | 24.956 |
| 13.322 | 25.15 |
| 13.1454 | 25.318 |
| 13.0489 | 25.39 |
| 13.1821 | 25.159 |
| 13.0965 | 25.277 |
| 12.9075 | 25.436 |
| 12.9057 | 25.375 |
| 12.8813 | 25.346 |
| 12.7288 | 25.617 |
| 12.679 | 25.693 |
| 12.6065 | 25.775 |
| 12.5665 | 25.849 |
| 12.5409 | 26.004 |
| 12.5265 | 26.151 |
| 12.4745 | 26.289 |
| 12.3868 | 26.43 |
| 12.3849 | 26.479 |
| 12.3776 | 26.474 |
| 12.3179 | 26.681 |
| 12.3098 | 26.762 |
| 12.2661 | 26.846 |
| 12.2301 | 26.886 |
| 12.1355 | 26.98 |
| 12.0913 | 27.085 |
| 12.0482 | 27.15 |
| 11.9916 | 27.2 |
| 11.9704 | 27.221 |
| 11.9897 | 27.212 |
| 11.986 | 27.21 |
| 11.9881 | 27.21 |
| 11.974 | 27.207 |
| 11.9843 | 27.212 |
| 12.1079 | 27.011 |
| 12.0161 | 26.799 |
| 12.0795 | 26.475 |
| 12.3041 | 26.264 |
| 12.2478 | 26.404 |
| 12.324 | 26.399 |
| 12.3601 | 26.284 |
| 12.3934 | 26.314 |
| 12.4086 | 26.02 |
| 12.4455 | 25.632 |
| 12.4515 | 25.237 |
| 12.5017 | 25.123 |
| 12.5829 | 24.587 |
| 12.6038 | 25.808 |
| 12.7192 | 25.852 |
| 12.8551 | 25.398 |
| 13.0988 | 25.584 |
| 12.8435 | 25.553 |
| 13.1613 | 25.565 |
| 13.2719 | 25.185 |
| 13.2773 | 24.904 |
| 13.496 | 25.109 |
| 13.1555 | 24.991 |
| 13.1522 | 25.285 |
| 12.9749 | 25.409 |
| 13.0764 | 25.358 |
| 13.1997 | 25.309 |
| 13.8827 | 25.608 |
| 13.5141 | 25.684 |
| 13.0882 | 25.737 |
| 13.1503 | 25.774 |
| 13.1414 | 25.789 |
| 12.8851 | 26.138 |
| 12.7834 | 26.175 |
| 12.832 | 26.152 |
| 12.7521 | 26.197 |
| 12.6376 | 26.354 |
| 12.5762 | 26.438 |
| 12.5411 | 26.398 |
| 12.526 | 26.084 |
| 12.5112 | 25.878 |
| 12.4926 | 25.686 |
| 12.4703 | 25.435 |
| 12.4403 | 25.265 |
| 12.4118 | 25.295 |
| 12.3859 | 25.229 |
| 12.3721 | 25.218 |
| 12.3464 | 25.281 |
| 12.3412 | 25.313 |
| 12.3201 | 25.351 |
| 12.3229 | 25.341 |
| 12.3203 | 25.314 |
| 12.2987 | 25.321 |
| 12.2931 | 25.304 |
| 12.3167 | 25.231 |
| 12.2855 | 25.232 |
| 12.2772 | 25.235 |
| 12.2959 | 25.288 |
| 12.3285 | 25.435 |
| 12.3697 | 25.933 |
| 12.7055 | 26.046 |
| 12.8393 | 25.984 |
| 13.0969 | 25.846 |
| 13.5524 | 25.672 |
| 13.4166 | 25.781 |
| 13.3972 | 25.838 |
| 13.1441 | 26.032 |
| 13.2142 | 25.914 |
| 13.1576 | 25.888 |
| 13.1065 | 25.846 |
| 13.1091 | 25.868 |
| 13.1295 | 25.899 |
| 13.0706 | 25.862 |
| 13.0776 | 25.886 |
| 12.9692 | 25.853 |
| 12.9815 | 25.879 |
| 12.9103 | 25.88 |
| 12.8663 | 25.858 |
| 12.9039 | 25.852 |
| 12.7144 | 26.01 |
| 12.7901 | 25.891 |
| 12.7018 | 26.025 |
| 12.6839 | 26.117 |
| 12.6534 | 26.175 |
| 12.654 | 26.205 |
| 12.6531 | 26.194 |
| 12.6676 | 26.181 |
| 12.6491 | 26.154 |
| 12.5913 | 26.183 |
| 12.561 | 26.145 |
| 12.5405 | 26.164 |
| 12.5054 | 26.132 |
| 12.4789 | 26.099 |
| 12.4554 | 26.073 |
| 12.4166 | 26.015 |
| 12.406 | 26 |
| 12.3687 | 25.973 |
| 12.326 | 25.952 |
| 12.2652 | 25.947 |
| 12.2908 | 25.955 |
| 12.3554 | 25.95 |
| 12.3589 | 25.949 |
| 12.5167 | 25.974 |
| 12.6101 | 26.023 |
| 12.6327 | 26.045 |
| 12.823 | 26.111 |
| 13.0241 | 26.159 |
| 13.0297 | 26.088 |
| 13.1553 | 26.028 |
| 13.1786 | 25.883 |
| 13.1815 | 25.824 |
| 13.3224 | 25.758 |
| 13.2482 | 26.058 |
| 13.3664 | 26.068 |
| 13.5465 | 26.097 |
| 13.4562 | 25.767 |
| 13.709 | 26.083 |
| 13.7262 | 25.768 |
| 13.711 | 25.69 |
| 14.0587 | 26.007 |
| 14.3193 | 25.942 |
| 14.0561 | 25.481 |
| 14.0395 | 25.551 |
| 13.9567 | 25.672 |
| 13.7987 | 25.722 |
| 13.7618 | 25.763 |
| 13.6349 | 25.702 |
| 13.559 | 25.735 |
| 13.5949 | 25.833 |
| 13.6664 | 25.873 |
| 13.2888 | 26.039 |
| 13.2369 | 26.063 |
| 13.1501 | 26.078 |
| 13.2373 | 26.03 |
| 13.2343 | 25.977 |
| 13.1606 | 25.971 |
| 12.9577 | 26.002 |
| 12.8515 | 26.058 |
| 12.7872 | 26.141 |
| 12.6506 | 26.394 |
| 12.5668 | 26.566 |
| 12.5516 | 26.584 |
| 12.5135 | 26.646 |
| 12.4268 | 26.774 |
| 12.3626 | 26.967 |
| 12.2776 | 27.215 |
| 12.2115 | 27.417 |
| 12.16 | 27.543 |
| 12.1191 | 27.663 |
| 12.1142 | 27.636 |
| 12.0891 | 27.68 |
| 12.1886 | 27.188 |
| 12.2319 | 26.982 |
| 12.2852 | 26.971 |
| 12.314 | 26.845 |
| 12.3637 | 26.645 |
| 12.6877 | 26.132 |
| 12.7769 | 26.071 |
| 12.6849 | 26.088 |
| 12.8119 | 26.036 |
| 12.8917 | 26.019 |
| 13.4087 | 25.865 |
| 13.4943 | 25.765 |
| 13.0339 | 25.918 |
| 13.415 | 25.87 |
| 13.6068 | 25.904 |
| 13.3427 | 25.865 |
| 13.4618 | 25.828 |
| 13.3997 | 25.823 |
| 13.2695 | 25.81 |
| 13.3452 | 25.68 |
| 13.2293 | 25.831 |
| 13.3193 | 25.63 |
| 13.1601 | 25.761 |
| 13.1769 | 25.791 |
| 13.2088 | 25.725 |
| 13.1435 | 25.716 |
| 13.1444 | 25.701 |
| 13.1192 | 25.704 |
| 13.0644 | 25.648 |
| 13.089 | 25.676 |
| 13.0284 | 25.78 |
| 13.0422 | 25.783 |
| 12.9598 | 25.945 |
| 12.8949 | 26.017 |
| 12.9219 | 26.018 |
| 12.9202 | 26.018 |
| 12.9262 | 25.846 |
| 12.9087 | 25.857 |
| 12.8448 | 25.975 |
| 12.7444 | 26.146 |
| 12.6421 | 26.282 |
| 12.4704 | 26.623 |
| 12.2621 | 27.051 |
| 12.1666 | 27.246 |
| 12.0947 | 27.411 |
| 12.0593 | 27.504 |
| 12.0495 | 27.578 |
| 12.024 | 27.67 |
| 12.0375 | 27.684 |
| 12.052 | 27.716 |
| 12.0847 | 27.601 |
| 12.0827 | 27.615 |
| 12.2227 | 27.34 |
| 13.0789 | 26.003 |
| 13.1724 | 26.001 |
| 13.1918 | 25.914 |
| 13.1142 | 26.167 |
| 13.1813 | 26.105 |
| 13.2721 | 25.889 |
| 13.3222 | 25.794 |
| 13.222 | 25.682 |
| 13.3219 | 25.54 |
| 13.3413 | 25.555 |
| 13.3301 | 25.623 |
| 13.3003 | 25.874 |
| 13.3911 | 25.753 |
| 13.4944 | 25.791 |
| 13.4774 | 25.831 |
| 13.5671 | 25.82 |
| 13.5349 | 25.729 |
| 13.506 | 25.664 |
| 13.5455 | 25.632 |
| 13.5826 | 25.71 |
| 13.583 | 25.73 |
| 13.4676 | 25.816 |
| 13.4661 | 25.801 |
| 13.3148 | 25.845 |
| 13.2589 | 25.856 |
| 13.1319 | 25.943 |
| 13.2876 | 25.937 |
| 12.9544 | 26.368 |
| 13.0105 | 26.248 |
| 13.0253 | 26.246 |
| 12.9682 | 26.29 |
| 12.8493 | 26.353 |
| 12.5076 | 27.102 |
| 12.4305 | 27.31 |
| 12.3811 | 27.865 |
| 12.3059 | 28.046 |
| 12.2206 | 28.264 |
| 12.1755 | 28.354 |
| 12.1223 | 28.49 |
| 12.0566 | 28.623 |
| 11.9979 | 28.724 |
| 11.9357 | 28.874 |
| 11.8856 | 28.96 |
| 11.8695 | 28.988 |
| 11.8089 | 29.071 |
| 11.8036 | 29.078 |
| 11.9144 | 28.788 |
| 11.8607 | 28.919 |
| 11.9407 | 28.773 |
| 12.2126 | 27.826 |
| 12.6742 | 26.64 |
| 12.5778 | 26.726 |
| 12.555 | 26.812 |
| 12.52 | 26.87 |
| 12.4237 | 27.095 |
| 12.6016 | 26.719 |
| 12.6929 | 26.476 |
| 12.9056 | 26.272 |
| 13.2603 | 26.002 |
| 12.8509 | 26.273 |
| 12.8845 | 26.138 |
| 12.7527 | 26.37 |
| 12.8019 | 26.055 |
| 12.7421 | 26.221 |
| 12.7553 | 25.971 |
| 12.7617 | 25.915 |
| 12.6896 | 26.082 |
| 12.7699 | 25.766 |
| 13.0389 | 25.33 |
| 12.9501 | 25.494 |
| 12.814 | 25.855 |
| 12.9462 | 25.283 |
| 12.9304 | 25.436 |
| 12.9717 | 25.497 |
| 12.897 | 25.438 |
| 12.9338 | 25.504 |
| 12.9253 | 25.636 |
| 12.9291 | 25.784 |
| 12.9188 | 25.862 |
| 12.7928 | 26.034 |
| 12.7398 | 26.255 |
| 12.7708 | 26.146 |
| 12.758 | 26.239 |
| 12.7652 | 26.188 |
| 12.7207 | 26.5 |
| 12.6726 | 26.699 |
| 12.5539 | 27.038 |
| 12.3997 | 27.357 |
| 12.2479 | 27.585 |
| 12.2055 | 27.685 |
| 12.1314 | 27.847 |
| 12.1015 | 27.935 |
| 12.0764 | 27.939 |
| 12.0913 | 27.892 |
| 12.1024 | 27.866 |
| 12.0899 | 27.887 |
| 12.094 | 27.888 |
| 12.0983 | 27.879 |
| 12.1027 | 27.883 |
| 12.129 | 27.878 |
| 12.1573 | 27.874 |
| 12.1555 | 27.872 |
| 12.9705 | 26.351 |
| 12.9734 | 26.216 |
| 12.8979 | 26.522 |
| 12.8687 | 26.499 |
| 12.8705 | 26.512 |
| 12.8851 | 26.447 |
| 13.0763 | 25.966 |
| 13.1095 | 25.913 |
| 13.0973 | 25.856 |
| 13.1409 | 25.672 |
| 13.1728 | 25.713 |
| 13.1453 | 25.852 |
| 13.1887 | 25.735 |
| 13.0988 | 26.1 |
| 13.1076 | 26.106 |
| 13.1444 | 26.027 |
| 13.193 | 26.001 |
| 13.141 | 25.998 |
| 13.1715 | 25.975 |
| 13.0646 | 26.025 |
| 13.0269 | 26.068 |
| 13.022 | 26.103 |
| 12.9535 | 26.255 |
| 12.8536 | 26.454 |
| 12.8317 | 26.501 |
| 12.6906 | 26.855 |
| 12.6326 | 26.952 |
| 12.5902 | 27.026 |
| 12.4961 | 27.186 |
| 12.4664 | 27.246 |
| 12.4052 | 27.347 |
| 12.3616 | 27.397 |
| 12.3357 | 26.494 |
| 12.3328 | 25.734 |
| 12.322 | 25.233 |
| 12.3074 | 25.069 |
| 12.2934 | 25.036 |
| 12.2808 | 25.06 |
| 12.2609 | 25.003 |
| 12.2539 | 24.979 |
| 12.2404 | 24.91 |
| 12.2248 | 25.06 |
| 12.2207 | 25.082 |
| 12.2095 | 24.843 |
| 12.2115 | 24.951 |
| 12.2213 | 24.857 |
| 12.2273 | 24.884 |
| 12.2471 | 24.965 |
| 12.2922 | 25.166 |
| 12.3369 | 25.956 |
| 12.3263 | 26.216 |
| 12.6509 | 26.436 |
| 12.7497 | 26.295 |
| 12.7555 | 26.253 |
| 12.7764 | 26.212 |
| 12.8446 | 26.073 |
| 12.8606 | 26.051 |
| 12.8938 | 26.058 |
| 12.8483 | 26.13 |
| 12.8114 | 26.148 |
| 12.8892 | 25.888 |
| 12.8846 | 25.778 |
| 12.8108 | 25.96 |
| 12.8049 | 25.888 |
| 12.8587 | 25.777 |
| 12.85 | 25.656 |
| 12.9391 | 25.398 |
| 12.8512 | 25.659 |
| 12.8397 | 25.622 |
| 12.9183 | 25.509 |
| 12.8993 | 25.36 |
| 12.9457 | 25.393 |
| 12.9539 | 25.476 |
| 12.8994 | 25.657 |
| 12.9242 | 25.767 |
| 12.9119 | 25.704 |
| 12.8981 | 25.842 |
| 12.8122 | 26.064 |
| 12.701 | 26.161 |
| 12.76 | 26.177 |
| 12.7459 | 26.164 |
| 12.7134 | 26.204 |
| 12.7262 | 26.184 |
| 12.6384 | 26.178 |
| 12.5139 | 25.989 |
| 12.3509 | 25.598 |
| 12.2946 | 25.163 |
| 12.2819 | 24.915 |
| 12.2781 | 24.693 |
| 12.2757 | 24.444 |
| 12.264 | 24.234 |
| 12.2651 | 24.095 |
| 12.2683 | 24.083 |
| 12.2746 | 23.994 |
| 12.2823 | 23.973 |
| 12.2859 | 23.944 |
| 12.3081 | 23.987 |
| 12.3277 | 24.006 |
| 12.3635 | 24.074 |
| 12.3542 | 24.124 |
| 12.3864 | 24.138 |
| 12.4658 | 24.278 |
| 12.5573 | 24.778 |
| 12.8488 | 25.479 |
| 13.3374 | 25.825 |
| 13.3478 | 25.894 |
| 13.3866 | 25.807 |
| 13.3796 | 25.641 |
| 13.402 | 25.551 |
| 13.5391 | 25.325 |
| 13.5894 | 25.253 |
| 13.5974 | 25.249 |
| 13.513 | 25.344 |
| 13.5224 | 25.496 |
| 13.4493 | 25.659 |
| 13.4221 | 25.691 |
| 13.3825 | 25.716 |
| 13.3672 | 25.7 |
| 13.3853 | 25.789 |
| 13.3959 | 25.712 |
| 13.2741 | 25.727 |
| 13.0821 | 25.832 |
| 13.0444 | 25.792 |
| 12.8713 | 25.762 |
| 12.7826 | 25.493 |
| 12.7658 | 25.466 |
| 12.7359 | 25.418 |
| 12.6454 | 25.357 |
| 12.6048 | 25.299 |
| 12.5543 | 25.179 |
| 12.5091 | 25.165 |
| 12.3554 | 25.364 |
| 12.3325 | 25.257 |
| 12.3492 | 25.025 |
| 12.3713 | 24.795 |
| 12.358 | 24.741 |
| 12.3445 | 24.772 |
| 12.3326 | 24.777 |
| 12.3178 | 24.804 |
| 12.3095 | 24.81 |
| 12.3019 | 24.811 |
| 12.2963 | 24.805 |
| 12.3049 | 24.788 |
| 12.3139 | 24.775 |
| 12.3175 | 24.784 |
| 12.3236 | 24.779 |
| 12.3515 | 24.752 |
| 12.3345 | 24.995 |
| 12.4364 | 25.171 |
| 12.4669 | 25.196 |
| 13.1932 | 25.608 |
| 13.2094 | 25.647 |
| 13.5009 | 25.526 |
| 13.3831 | 25.35 |
| 13.0034 | 25.261 |
| 13.1178 | 25.171 |
| 13.1794 | 25.412 |
| 13.2127 | 25.321 |
| 13.1624 | 25.484 |
| 13.149 | 25.41 |
| 12.9098 | 25.274 |
| 13.4229 | 25.035 |
| 13.1506 | 25.263 |
| 13.2723 | 25.101 |
| 13.2415 | 25.178 |
| 13.3463 | 24.935 |
| 13.4656 | 24.694 |
| 13.3873 | 24.95 |
| 13.2788 | 25.17 |
| 13.336 | 25.07 |
| 13.3175 | 25.048 |
| 13.3269 | 25.109 |
| 13.2311 | 25.328 |
| 13.2185 | 25.34 |
| 13.2039 | 25.449 |
| 13.1707 | 25.524 |
| 13.1339 | 25.549 |
| 13.1135 | 25.561 |
| 13.1231 | 25.47 |
| 13.1366 | 25.432 |
| 13.044 | 25.372 |
| 12.9721 | 25.397 |
| 12.8853 | 25.412 |
| 12.8412 | 25.378 |
| 12.7214 | 25.265 |
| 12.5836 | 25.113 |
| 12.5915 | 25.094 |
| 12.5341 | 25.005 |
| 12.5235 | 24.975 |
| 12.4991 | 24.961 |
| 12.5058 | 24.996 |
| 12.4581 | 25.002 |
| 12.4294 | 25.003 |
| 12.3773 | 25.007 |
| 12.3556 | 25.013 |
| 12.3487 | 25.051 |
| 12.3798 | 25.03 |
| 12.4009 | 25.017 |
| 12.6026 | 25.004 |
| 12.7342 | 25.004 |
| 12.7963 | 24.994 |
| 12.9907 | 25.041 |
| 12.987 | 25.04 |
| 13.1058 | 25.122 |
| 13.3302 | 25.274 |
| 13.7084 | 25.413 |
| 13.8017 | 25.439 |
| 14.0552 | 25.417 |
| 13.7868 | 25.246 |
| 14.0171 | 25.095 |
| 14.1893 | 25.085 |
| 14.0654 | 25.136 |
| 14.041 | 25.026 |
| 13.8682 | 25.126 |
| 13.9642 | 25.132 |
| 13.8045 | 25.188 |
| 13.7799 | 25.2 |
| 13.7145 | 25.229 |
| 13.854 | 25.198 |
| 13.6907 | 25.271 |
| 13.4608 | 25.259 |
| 13.2719 | 25.246 |
| 12.9848 | 25.19 |
| 13.1158 | 25.206 |
| 13.1344 | 25.177 |
| 12.8934 | 25.087 |
| 12.862 | 25.055 |
| 12.7544 | 25.06 |
| 12.7842 | 25.04 |
| 12.6675 | 25.037 |
| 12.6184 | 25.085 |
| 12.588 | 25.138 |
| 12.5495 | 25.146 |
| 12.5541 | 24.966 |
| 12.539 | 24.84 |
| 12.5148 | 24.869 |
| 12.4786 | 24.906 |
| 12.4472 | 24.998 |
| 12.4526 | 25.109 |
| 12.4374 | 25.128 |
| 12.4439 | 25.114 |
| 12.423 | 25.089 |
| 12.3871 | 25.023 |
| 12.4359 | 24.947 |
| 12.4314 | 24.917 |
| 12.4498 | 24.907 |
| 12.4859 | 25.105 |
| 12.5071 | 25.066 |
| 12.6032 | 25.066 |
| 13.0316 | 25.256 |
| 13.212 | 25.276 |
| 13.3774 | 25.333 |
| 13.0912 | 25.099 |
| 13.1177 | 24.925 |
| 13.2461 | 24.956 |
| 13.215 | 24.96 |
| 13.0854 | 25.025 |
| 12.9876 | 25.037 |
| 12.9777 | 25.029 |
| 12.9855 | 25.035 |
| 12.993 | 25.039 |
| 13.0289 | 25.068 |
| 13.0869 | 24.964 |
| 13.0923 | 24.915 |
| 13.2492 | 24.518 |
| 13.23 | 24.553 |
| 13.2138 | 24.655 |
| 13.2488 | 24.6 |
| 13.2654 | 24.739 |
| 13.2625 | 24.73 |
| 13.2897 | 24.903 |
| 13.246 | 24.995 |
| 13.2509 | 24.976 |
| 13.229 | 25.138 |
| 13.2239 | 25.186 |
| 13.1429 | 25.211 |
| 13.2105 | 25.137 |
| 13.1954 | 25.083 |
| 13.2151 | 25.025 |
| 13.1717 | 25.037 |
| 13.1562 | 25.116 |
| 13.0652 | 25.153 |
| 12.9851 | 25.187 |
| 12.7288 | 25.439 |
| 12.6429 | 25.52 |
| 12.5798 | 25.541 |
| 12.4907 | 25.58 |
| 12.3805 | 25.889 |
| 12.402 | 26.062 |
| 12.3983 | 26.155 |
| 12.4 | 26.225 |
| 12.3921 | 26.393 |
| 12.389 | 26.448 |
| 12.3978 | 26.481 |
| 12.3896 | 26.515 |
| 12.414 | 26.523 |
| 12.4635 | 26.418 |
| 12.4991 | 26.362 |
| 12.6889 | 26.154 |
| 12.7046 | 26.061 |
| 12.8151 | 25.973 |
| 13.0352 | 25.777 |
| 13.304 | 25.583 |
| 13.5617 | 25.439 |
| 13.6502 | 25.41 |
| 14.0445 | 25.315 |
| 14.1541 | 25.19 |
| 14.2012 | 25.053 |
| 14.3242 | 24.952 |
| 14.4234 | 25.001 |
| 14.5855 | 25.02 |
| 14.5591 | 24.937 |
| 14.4763 | 24.936 |
| 14.1645 | 25.125 |
| 14.3331 | 25.078 |
| 14.2002 | 25.135 |
| 14.0509 | 25.16 |
| 13.8659 | 25.179 |
| 13.8283 | 25.137 |
| 13.4822 | 25.189 |
| 13.2993 | 25.173 |
| 13.2321 | 25.211 |
| 13.1565 | 25.259 |
| 13.2679 | 25.418 |
| 13.0672 | 25.506 |
| 12.9999 | 25.57 |
| 12.8759 | 25.549 |
| 12.8868 | 25.595 |
| 12.7724 | 25.875 |
| 12.5729 | 26.775 |
| 12.5001 | 27.054 |
| 12.4015 | 27.216 |
| 12.3074 | 27.488 |
| 12.2164 | 27.72 |
| 12.1 | 28.04 |
| 12.0376 | 28.246 |
| 12.0095 | 28.313 |
| 11.9976 | 28.345 |
| 11.9922 | 28.359 |
| 12.062 | 28.109 |
| 12.0861 | 28.01 |
| 12.0421 | 28.197 |
| 12.65 | 26.078 |
| 12.8828 | 25.763 |
| 12.8524 | 25.866 |
| 12.9029 | 25.686 |
| 12.9239 | 25.735 |
| 13.1302 | 25.412 |
| 13.2839 | 25.279 |
| 13.4289 | 25.212 |
| 13.5491 | 25.177 |
| 13.1084 | 25.362 |
| 13.3947 | 25.073 |
| 13.5064 | 25.067 |
| 13.5417 | 25.06 |
| 13.6659 | 25.037 |
| 13.5922 | 25.061 |
| 13.7838 | 24.928 |
| 13.754 | 24.868 |
| 13.678 | 24.898 |
| 13.6709 | 24.821 |
| 13.645 | 24.745 |
| 13.7114 | 24.627 |
| 13.6646 | 24.692 |
| 13.6627 | 24.717 |
| 13.6955 | 24.616 |
| 13.7083 | 24.6 |
| 13.7245 | 24.669 |
| 13.7232 | 24.672 |
| 13.7225 | 24.643 |
| 13.7493 | 24.682 |
| 13.6942 | 24.675 |
| 13.6802 | 24.898 |
| 13.6354 | 24.995 |
| 13.4625 | 25.067 |
| 13.5077 | 24.784 |
| 13.515 | 24.744 |
| 13.5077 | 24.777 |
| 13.4083 | 24.849 |
| 13.3586 | 24.983 |
| 13.1449 | 25.325 |
| 12.9371 | 25.684 |
| 12.6839 | 26.233 |
| 12.49 | 26.742 |
| 12.3708 | 27.081 |
| 12.2395 | 27.428 |
| 12.1482 | 27.636 |
| 12.111 | 27.767 |
| 12.0983 | 27.845 |
| 12.0892 | 27.869 |
| 12.071 | 27.94 |
| 12.0675 | 27.949 |
| 12.0734 | 27.926 |
| 12.0683 | 27.924 |
| 12.0726 | 27.916 |
| 12.0911 | 27.869 |
| 12.1193 | 27.754 |
| 13.0189 | 25.699 |
| 12.9682 | 25.8 |
| 13.0142 | 25.702 |
| 13.0777 | 25.486 |
| 12.9887 | 25.69 |
| 13.0834 | 25.408 |
| 13.1077 | 25.258 |
| 13.2451 | 25.061 |
| 13.2686 | 24.956 |
| 13.1142 | 24.933 |
| 13.0116 | 25.178 |
| 13.0353 | 25.018 |
| 13.1184 | 24.753 |
| 13.0734 | 24.978 |
| 13.0352 | 25.087 |
| 13.0828 | 25.012 |
| 13.0944 | 24.987 |
| 13.082 | 24.896 |
| 13.1001 | 24.913 |
| 13.1263 | 25.048 |
| 13.1855 | 25.267 |
| 13.0963 | 25.43 |
| 12.9695 | 25.348 |
| 12.893 | 25.845 |
| 12.8685 | 25.804 |
| 12.7916 | 25.825 |
| 12.6534 | 26.346 |
| 12.5651 | 26.59 |
| 12.4833 | 26.769 |
| 12.3602 | 27.115 |
| 12.1636 | 27.644 |
| 11.954 | 28.038 |
| 11.8636 | 28.27 |
| 11.838 | 28.333 |
| 11.7635 | 28.531 |
| 11.6978 | 28.724 |
| 11.6605 | 28.805 |
| 11.5853 | 28.957 |
| 11.5594 | 28.996 |
| 11.5549 | 28.992 |
| 11.5347 | 29.014 |
| 11.5718 | 28.957 |
| 11.6364 | 28.792 |
| 11.6523 | 28.759 |
| 11.7119 | 28.572 |
| 12.4129 | 26.595 |
| 12.4638 | 26.472 |
| 12.5043 | 26.368 |
| 12.4232 | 26.555 |
| 12.5587 | 25.981 |
| 12.6115 | 25.684 |
| 12.5254 | 25.369 |
| 12.435 | 25.198 |
| 12.4783 | 25.846 |
| 12.5467 | 25.422 |
| 12.5374 | 25.445 |
| 12.4616 | 25.342 |
| 12.4007 | 25.709 |
| 12.576 | 25.016 |
| 12.7141 | 24.488 |
| 12.5896 | 24.816 |
| 12.5667 | 24.789 |
| 12.5863 | 24.726 |
| 12.6168 | 24.722 |
| 12.623 | 24.137 |
| 12.6258 | 24.318 |
| 12.629 | 24.289 |
| 12.6319 | 24.289 |
| 12.7382 | 24.3 |
| 12.7161 | 24.274 |
| 12.9188 | 24.31 |
| 13.1769 | 24.383 |
| 13.1152 | 24.313 |
| 12.8697 | 24.536 |
| 12.9692 | 24.633 |
| 12.9221 | 24.802 |
| 12.9677 | 24.69 |
| 12.9102 | 24.384 |
| 12.8552 | 24.592 |
| 12.814 | 25.024 |
| 12.882 | 25.248 |
| 12.8979 | 25.507 |
| 12.7098 | 26.074 |
| 12.5402 | 26.526 |
| 12.2759 | 27.183 |
| 12.1676 | 27.548 |
| 12.0288 | 27.92 |
| 11.9516 | 28.115 |
| 11.8172 | 28.446 |
| 11.788 | 28.526 |
| 11.7524 | 28.635 |
| 11.7436 | 28.689 |
| 11.748 | 28.714 |
| 11.7371 | 28.753 |
| 11.7445 | 28.765 |
| 11.7757 | 28.757 |
| 11.7846 | 28.751 |
| 11.8222 | 28.743 |
| 12.0764 | 28.495 |
| 13.166 | 25.637 |
| 12.9676 | 26.31 |
| 12.9725 | 26.333 |
| 13.0505 | 26.377 |
| 13.1316 | 26.253 |
| 13.1166 | 26.257 |
| 13.2953 | 25.991 |
| 13.6258 | 25.606 |
| 13.9 | 25.216 |
| 14.0607 | 25.081 |
| 14.0329 | 25.01 |
| 14.3303 | 24.911 |
| 14.2732 | 24.944 |
| 14.295 | 24.912 |
| 14.0234 | 25.117 |
| 13.942 | 25.255 |
| 13.8567 | 25.366 |
| 13.8126 | 25.303 |
| 13.468 | 25.552 |
| 13.6344 | 25.304 |
| 13.3701 | 25.554 |
| 13.0879 | 25.866 |
| 13.0834 | 25.874 |
| 12.9105 | 26.359 |
| 12.9799 | 26.31 |
| 12.5917 | 27.178 |
| 12.5585 | 27.137 |
| 12.4511 | 27.342 |
| 12.3181 | 27.61 |
| 12.1568 | 28.091 |
| 12.0768 | 28.328 |
| 12.0455 | 28.416 |
| 12.0123 | 28.779 |
| 11.9637 | 28.944 |
| 11.8859 | 29.05 |
| 11.8219 | 29.199 |
| 11.7861 | 29.287 |
| 11.7683 | 29.327 |
| 11.7537 | 29.366 |
| 11.7497 | 29.357 |
| 11.7462 | 29.365 |
| 11.7708 | 29.267 |
| 11.8194 | 29.08 |
| 11.8295 | 29.123 |
| 11.8555 | 29.028 |
| 12.312 | 27.545 |
| 12.482 | 27.19 |
| 12.4472 | 27.329 |
| 12.4595 | 27.274 |
| 12.4698 | 27.282 |
| 12.6213 | 26.925 |
| 12.8894 | 26.279 |
| 12.9181 | 26.123 |
| 13.0574 | 25.681 |
| 12.797 | 26.086 |
| 12.8565 | 26.044 |
| 12.9684 | 25.598 |
| 12.7701 | 26.079 |
| 13.0677 | 25.23 |
| 12.8644 | 25.807 |
| 13.0184 | 25.372 |
| 12.9303 | 25.594 |
| 12.9182 | 25.67 |
| 12.9954 | 25.431 |
| 13.1125 | 24.869 |
| 13.1059 | 24.924 |
| 13.1316 | 24.823 |
| 13.1258 | 24.824 |
| 13.1337 | 24.892 |
| 13.1781 | 24.898 |
| 13.1717 | 24.945 |
| 13.1842 | 25.004 |
| 13.1276 | 25.13 |
| 13.0838 | 25.382 |
| 13.1089 | 25.17 |
| 12.9608 | 25.679 |
| 12.9562 | 25.746 |
| 12.8525 | 25.99 |
| 12.8816 | 25.663 |
| 12.7925 | 26.144 |
| 12.7456 | 26.378 |
| 12.6707 | 26.619 |
| 12.5822 | 26.901 |
| 12.4049 | 27.384 |
| 12.2636 | 27.788 |
| 12.1477 | 28.159 |
| 12.0279 | 28.492 |
| 12.0284 | 28.486 |
| 12.0421 | 28.447 |
| 12.0291 | 28.498 |
| 12.0338 | 28.543 |
| 12.0353 | 28.64 |
| 12.0414 | 28.67 |
| 12.033 | 28.71 |
| 12.0375 | 28.702 |
| 12.0471 | 28.695 |
| 12.1368 | 28.626 |
| 12.0768 | 28.684 |
| 12.0655 | 28.697 |
| 12.9059 | 26.634 |
| 12.8297 | 26.77 |
| 12.8063 | 26.805 |
| 12.7555 | 27.029 |
| 12.6427 | 27.296 |
| 12.7663 | 27.067 |
| 12.7424 | 27.069 |
| 13.0627 | 26.484 |
| 13.3425 | 26.058 |
| 13.499 | 25.835 |
| 13.7096 | 25.635 |
| 13.7648 | 25.596 |
| 13.7294 | 25.614 |
| 13.921 | 25.535 |
| 13.7139 | 25.656 |
| 13.7949 | 25.599 |
| 13.6339 | 25.742 |
| 13.7123 | 25.656 |
| 13.5221 | 25.825 |
| 13.1903 | 26.035 |
| 13.0022 | 26.186 |
| 12.8861 | 26.413 |
| 12.7282 | 26.821 |
| 12.6706 | 26.983 |
| 12.7014 | 26.932 |
| 12.6194 | 27.134 |
| 12.5795 | 27.202 |
| 12.4718 | 27.452 |
| 12.4005 | 27.566 |
| 12.3493 | 27.72 |
| 12.2815 | 27.932 |
| 12.2002 | 28.153 |
| 12.1851 | 28.266 |
| 12.1711 | 28.302 |
| 12.192 | 28.21 |
| 12.2297 | 28.044 |
| 12.2645 | 27.887 |
| 12.2862 | 27.786 |
| 12.302 | 27.711 |
| 12.3088 | 27.672 |
| 12.3131 | 27.653 |
| 12.3132 | 27.651 |
| 12.3114 | 27.658 |
| 12.3023 | 27.702 |
| 12.2861 | 27.78 |
| 12.6082 | 27.111 |
| 12.5815 | 27.146 |
| 12.4527 | 27.487 |
| 12.4191 | 27.564 |
| 12.3686 | 27.681 |
| 12.4264 | 27.529 |
| 12.5668 | 27.135 |
| 12.8496 | 26.436 |
| 13.0559 | 25.807 |
| 13.1788 | 25.467 |
| 13.0113 | 25.616 |
| 13.0667 | 25.446 |
| 12.8933 | 26.259 |
| 13.1251 | 25.309 |
| 13.0721 | 25.418 |
| 13.0726 | 25.401 |
| 13.1933 | 24.827 |
| 13.2047 | 24.887 |
| 13.237 | 24.803 |
| 13.3073 | 24.491 |
| 13.2546 | 24.863 |
| 13.2189 | 24.947 |
| 13.3425 | 24.382 |
| 13.3008 | 24.592 |
| 13.2999 | 24.773 |
| 13.3321 | 24.817 |
| 13.2826 | 25.082 |
| 13.26 | 25.252 |
| 13.2903 | 25.254 |
| 13.2346 | 25.422 |
| 13.2167 | 25.545 |
| 13.0667 | 25.908 |
| 13.1444 | 25.124 |
| 13.1536 | 24.713 |
| 13.0713 | 25.124 |
| 12.8749 | 26.199 |
| 12.8083 | 26.482 |
| 12.7449 | 26.656 |
| 12.6723 | 26.832 |
| 12.635 | 26.694 |
| 12.6095 | 26.552 |
| 12.583 | 26.289 |
| 12.5543 | 26.104 |
| 12.5383 | 25.901 |
| 12.5265 | 25.751 |
| 12.5209 | 25.655 |
| 12.5213 | 25.597 |
| 12.5194 | 25.542 |
| 12.515 | 25.502 |
| 12.514 | 25.498 |
| 12.5179 | 25.493 |
| 12.5185 | 25.487 |
| 12.5282 | 25.484 |
| 12.5459 | 25.528 |
| 12.5649 | 25.593 |
| 12.8967 | 25.664 |
| 12.9736 | 25.752 |
| 12.7991 | 25.989 |
| 13.0726 | 26.189 |
| 13.2747 | 26.093 |
| 13.2313 | 26.023 |
| 13.4111 | 25.9 |
| 13.4727 | 25.815 |
| 13.7063 | 25.557 |
| 13.7868 | 25.451 |
| 13.9803 | 25.279 |
| 14.1364 | 25.102 |
| 14.1971 | 25.008 |
| 13.8499 | 25.35 |
| 13.4641 | 25.781 |
| 13.494 | 25.738 |
| 13.3819 | 25.881 |
| 13.4036 | 25.849 |
| 13.2199 | 25.941 |
| 13.2912 | 25.89 |
| 13.1486 | 26.03 |
| 12.9577 | 26.236 |
| 12.9646 | 26.218 |
| 13.0752 | 26.15 |
| 12.7973 | 26.153 |
| 12.8137 | 26.206 |
| 12.773 | 26.175 |
| 12.7225 | 26.167 |
| 12.6888 | 26.117 |
| 12.6609 | 25.938 |
| 12.658 | 25.835 |
| 12.6483 | 25.766 |
| 12.6127 | 25.681 |
| 12.5856 | 25.606 |
| 12.5684 | 25.507 |
| 12.5583 | 25.423 |
| 12.5516 | 25.321 |
| 12.5435 | 25.22 |
| 12.5483 | 25.202 |
| 12.5477 | 25.192 |
| 12.5483 | 25.203 |
| 12.5471 | 25.216 |
| 12.539 | 25.277 |
| 12.5488 | 25.463 |
| 12.5709 | 25.66 |
| 12.6087 | 25.858 |
| 12.6326 | 26.015 |
| 12.9412 | 26.037 |
| 13.0484 | 25.994 |
| 13.1041 | 25.803 |
| 13.0938 | 25.792 |
| 13.1351 | 25.81 |
| 13.2879 | 25.569 |
| 13.1618 | 25.374 |
| 13.2354 | 25.312 |
| 13.3581 | 25.268 |
| 13.2372 | 25.524 |
| 13.423 | 24.849 |
| 13.4436 | 24.792 |
| 13.4024 | 25.066 |
| 13.4875 | 24.853 |
| 13.5371 | 24.348 |
| 13.5075 | 24.887 |
| 13.6 | 24.698 |
| 13.5503 | 24.231 |
| 13.5004 | 24.82 |
| 13.5112 | 24.798 |
| 13.4916 | 24.856 |
| 13.4949 | 24.819 |
| 13.385 | 25.282 |
| 13.3775 | 25.271 |
| 13.394 | 25.345 |
| 13.291 | 25.5 |
| 13.267 | 25.582 |
| 13.1565 | 25.738 |
| 13.0894 | 25.812 |
| 13.1748 | 25.707 |
| 13.1493 | 25.659 |
| 13.1507 | 25.141 |
| 13.0407 | 25.637 |
| 12.9704 | 25.582 |
| 12.9323 | 25.586 |
| 12.8345 | 25.532 |
| 12.7516 | 25.382 |
| 12.7085 | 25.189 |
| 12.7072 | 25.001 |
| 12.7021 | 24.818 |
| 12.6889 | 24.676 |
| 12.6682 | 24.564 |
| 12.6486 | 24.495 |
| 12.6324 | 24.421 |
| 12.6191 | 24.374 |
| 12.601 | 24.344 |
| 12.5935 | 24.332 |
| 12.5892 | 24.327 |
| 12.5848 | 24.33 |
| 12.5941 | 24.326 |
| 12.6087 | 24.33 |
| 12.6269 | 24.36 |
| 12.6479 | 24.42 |
| 12.7072 | 24.627 |
| 12.7459 | 24.756 |
| 12.9391 | 25.165 |
| 13.0513 | 25.385 |
| 13.165 | 25.437 |
| 13.1252 | 25.438 |
| 13.1193 | 25.416 |
| 13.1469 | 25.429 |
| 13.2364 | 25.402 |
| 13.2582 | 25.383 |
| 13.1591 | 25.383 |
| 13.1409 | 25.396 |
| 13.1774 | 25.405 |
| 13.1838 | 25.4 |
| 12.9156 | 25.126 |
| 12.9729 | 25.189 |
| 12.9959 | 25.189 |
| 13.092 | 25.16 |
| 13.0846 | 25.146 |
| 13.0188 | 25.103 |
| 12.9036 | 25.122 |
| 12.8506 | 25.159 |
| 12.8738 | 25.113 |
| 12.8222 | 25.032 |
| 12.7753 | 24.867 |
| 12.7855 | 24.901 |
| 12.7774 | 24.874 |
| 12.7722 | 24.856 |
| 12.7644 | 24.812 |
| 12.742 | 24.721 |
| 12.7162 | 24.636 |
| 12.6802 | 24.537 |
| 12.6429 | 24.352 |
| 12.6473 | 24.155 |
| 12.6617 | 23.945 |
| 12.6674 | 23.69 |
| 12.6653 | 23.53 |
| 12.6619 | 23.382 |
| 12.6662 | 23.531 |
| 12.6674 | 23.556 |
| 12.6671 | 23.549 |
| 12.667 | 23.668 |
| 12.6592 | 24.28 |
| 12.7736 | 24.21 |
| 12.7463 | 24.071 |
| 12.7295 | 23.986 |
| 12.7229 | 23.94 |
| 12.7557 | 24.205 |
| 12.7763 | 24.366 |
| 12.8101 | 24.659 |
| 12.855 | 24.882 |
| 13.1504 | 24.981 |
| 13.2784 | 24.79 |
| 13.3451 | 24.373 |
| 13.4617 | 22.808 |
| 13.4494 | 22.37 |
| 13.4255 | 22.927 |
| 13.4486 | 22.765 |
| 13.4586 | 22.928 |
| 13.4036 | 23.295 |
| 13.3876 | 23.365 |
| 13.4132 | 23.486 |
| 13.4596 | 22.807 |
| 13.4798 | 22.723 |
| 13.4898 | 22.84 |
| 13.4888 | 23.042 |
| 13.4672 | 23.515 |
| 13.4854 | 23.491 |
| 13.4741 | 24.13 |
| 13.4685 | 24.33 |
| 13.4866 | 24.145 |
| 13.4722 | 24.271 |
| 13.3829 | 24.539 |
| 13.3114 | 24.634 |
| 13.2902 | 24.566 |
| 13.3108 | 24.467 |
| 13.1719 | 24.608 |
| 13.2493 | 23.969 |
| 13.1004 | 24.11 |
| 13.039 | 24.112 |
| 13.0048 | 23.786 |
| 12.9775 | 23.229 |
| 12.9553 | 22.718 |
| 12.9295 | 22.503 |
| 12.9034 | 22.629 |
| 12.868 | 22.518 |
| 12.823 | 22.416 |
| 12.7958 | 22.41 |
| 12.7732 | 22.329 |
| 12.7379 | 22.127 |
| 12.7258 | 22.098 |
| 12.7149 | 22.008 |
| 12.7085 | 21.988 |
| 12.7129 | 22.021 |
| 12.7573 | 22.238 |
| 12.7483 | 22.211 |
| 12.7377 | 22.229 |
| 12.6993 | 22.125 |
| 12.7347 | 22.254 |
| 12.882 | 22.646 |
| 12.9746 | 23.144 |
| 12.9972 | 23.423 |
| 13.1221 | 23.981 |
| 13.122 | 24.014 |
| 13.2762 | 24.052 |
| 13.4526 | 24.164 |
| 13.4477 | 23.844 |
| 13.4338 | 23.537 |
| 13.3779 | 23.28 |
| 13.3919 | 23.051 |
| 13.4235 | 22.975 |
| 13.3945 | 22.994 |
| 13.2845 | 23.123 |
| 12.9654 | 23.402 |
| 13.0096 | 23.46 |
| 13.1208 | 23.737 |
| 13.0734 | 23.709 |
| 13.0499 | 23.876 |
| 13.1027 | 24.021 |
| 12.9312 | 23.351 |
| 12.8836 | 23.262 |
| 12.8243 | 23.242 |
| 12.6748 | 22.759 |
| 12.7255 | 22.854 |
| 12.727 | 22.898 |
| 12.6904 | 22.771 |
| 12.7544 | 22.844 |
| 12.7627 | 22.852 |
| 12.7836 | 23.026 |
| 12.673 | 22.569 |
| 12.7133 | 22.619 |
| 12.6865 | 22.459 |
| 12.6623 | 22.36 |
| 12.6029 | 22.104 |
| 12.5578 | 21.937 |
| 12.5742 | 21.989 |
| 12.5597 | 21.98 |
| 12.6293 | 22.223 |
| 12.5764 | 22.104 |
| 12.5736 | 22.181 |
| 12.7178 | 22.601 |
| 12.6305 | 22.403 |
| 12.6833 | 22.492 |
| 12.7045 | 22.789 |
| 12.8014 | 23.281 |
| 12.7482 | 23.462 |
| 12.8708 | 23.851 |
| 12.8777 | 23.875 |
| 12.9189 | 23.573 |
| 12.8621 | 23.442 |
| 12.9787 | 23.238 |
| 13.0931 | 22.888 |
| 13.0724 | 22.392 |
| 13.1176 | 22.361 |
| 13.0771 | 22.467 |
| 13.168 | 22.042 |
| 13.3023 | 22.111 |
| 13.4484 | 21.714 |
| 13.4791 | 21.531 |
| 13.6168 | 21.221 |
| 13.6912 | 21.054 |
| 13.8244 | 21.055 |
| 13.9165 | 21.263 |
| 13.3096 | 22.994 |
| 13.3193 | 23.358 |
| 13.374 | 23.428 |
| 13.3602 | 23.704 |
| 13.589 | 23.421 |
| 13.7243 | 23.243 |
| 13.7142 | 23.22 |
| 13.6377 | 23.448 |
| 13.7971 | 23.27 |
| 13.6001 | 23.029 |
| 13.7266 | 22.448 |
| 13.4949 | 22.98 |
| 13.462 | 22.642 |
| 13.5024 | 22.034 |
| 13.2677 | 22.716 |
| 13.2042 | 22.581 |
| 13.1725 | 22.573 |
| 13.1601 | 22.438 |
| 13.1463 | 22.258 |
| 13.129 | 22.095 |
| 13.1166 | 21.922 |
| 13.1062 | 21.75 |
| 13.0992 | 21.634 |
| 13.0956 | 21.531 |
| 13.0909 | 21.449 |
| 13.0886 | 21.362 |
| 13.0843 | 21.289 |
| 13.0824 | 21.273 |
| 13.0787 | 21.263 |
| 13.0831 | 21.256 |
| 13.079 | 21.263 |
| 13.0849 | 21.273 |
| 13.0747 | 21.32 |
| 13.0796 | 21.466 |
| 13.0846 | 21.529 |
| 13.0916 | 21.587 |
| 13.1668 | 22.098 |
| 13.6128 | 22.914 |
| 13.5888 | 23.105 |
| 13.3844 | 22.909 |
| 13.3916 | 22.907 |
| 13.5573 | 23.032 |
| 14.0852 | 23.154 |
| 14.2591 | 23.152 |
| 14.6655 | 22.764 |
| 14.297 | 22.263 |
| 14.0572 | 22.074 |
| 13.8495 | 22.081 |
| 13.5136 | 22.028 |
| 13.7797 | 22.682 |
| 13.8659 | 22.785 |
| 13.7575 | 22.799 |
| 13.6305 | 22.748 |
| 13.6098 | 22.936 |
| 13.5119 | 23.118 |
| 13.5206 | 23.124 |
| 13.4723 | 23.19 |
| 13.2602 | 22.525 |
| 13.1696 | 22.339 |
| 13.2332 | 22.432 |
| 13.277 | 22.318 |
| 13.1025 | 22.032 |
| 13.3352 | 22.1 |
| 13.3826 | 21.912 |
| 13.2955 | 22.232 |
| 13.1999 | 22.24 |
| 13.2228 | 21.684 |
| 13.162 | 21.381 |
| 13.105 | 21.641 |
| 13.0903 | 21.707 |
| 13.094 | 21.758 |
| 13.0816 | 21.717 |
| 13.0844 | 21.627 |
| 13.0965 | 21.708 |
| 13.0865 | 21.646 |
| 13.1126 | 21.655 |
| 13.0976 | 21.722 |
| 13.1535 | 21.852 |
| 13.1369 | 21.893 |
| 13.1857 | 22.034 |
| 13.2642 | 22.187 |
| 13.3879 | 22.42 |
| 13.4903 | 22.507 |
| 13.5338 | 22.426 |
| 13.5924 | 22.43 |
| 13.6164 | 21.8 |
| 13.7357 | 21.168 |
| 13.7447 | 21.107 |
| 13.7164 | 20.793 |
| 13.7669 | 20.996 |
| 13.9825 | 21.158 |
| 14.0411 | 21.082 |
| 13.9398 | 21.162 |
| 14.1202 | 21.009 |
| 14.2878 | 21.121 |
| 14.19 | 21.22 |
| 14.0998 | 21.432 |
| 14.0893 | 21.594 |
| 13.8452 | 22.502 |
| 14.21 | 21.836 |
| 14.121 | 22.395 |
| 14.2113 | 22.303 |
| 14.565 | 21.598 |
| 14.5846 | 21.751 |
| 14.3454 | 22.167 |
| 14.2301 | 22.509 |
| 14.4949 | 22.285 |
| 14.5805 | 20.76 |
| 14.6064 | 19.316 |
| 14.5369 | 19.246 |
| 14.2705 | 19.862 |
| 14.2426 | 19.888 |
| 14.0652 | 20.365 |
| 13.8686 | 21.32 |
| 13.6583 | 22.2 |
| 13.6195 | 22.121 |
| 13.5871 | 22.039 |
| 13.5172 | 22.033 |
| 13.4672 | 21.998 |
| 13.4668 | 21.919 |
| 13.4806 | 21.843 |
| 13.4735 | 21.808 |
| 13.4775 | 21.8 |
| 13.4761 | 21.794 |
| 13.4651 | 21.823 |
| 13.4371 | 21.855 |
| 13.4268 | 21.864 |
| 13.4407 | 21.851 |
| 13.4623 | 21.8 |
| 13.4501 | 21.82 |
| 13.4487 | 21.802 |
| 13.4706 | 21.793 |
| 13.4336 | 21.798 |
| 13.4408 | 21.832 |
| 13.4288 | 21.831 |
| 13.472 | 21.921 |
| 13.7768 | 22.078 |
| 14.2721 | 22.367 |
| 14.2394 | 22.365 |
| 14.4855 | 22.088 |
| 15.0958 | 22.326 |
| 15.209 | 22.172 |
| 15.4034 | 21.841 |
| 15.0024 | 21.427 |
| 14.8948 | 21.471 |
| 14.9995 | 21.253 |
| 14.6576 | 20.858 |
| 14.5621 | 21.211 |
| 14.5097 | 21.402 |
| 14.2848 | 21.502 |
| 14.0764 | 21.641 |
| 13.9739 | 21.792 |
| 13.955 | 22.33 |
| 13.9274 | 22.454 |
| 13.8121 | 22.478 |
| 13.8285 | 22.601 |
| 13.8314 | 22.615 |
| 13.7635 | 22.497 |
| 13.9816 | 22.21 |
| 13.7958 | 22.378 |
| 13.7548 | 22.256 |
| 13.8409 | 22.207 |
| 13.7349 | 22.27 |
| 13.7574 | 21.639 |
| 13.7735 | 21.679 |
| 13.6909 | 21.85 |
| 13.6611 | 21.967 |
| 13.5941 | 21.96 |
| 13.5814 | 21.682 |
| 13.5847 | 21.613 |
| 13.5605 | 21.623 |
| 13.5412 | 21.704 |
| 13.5529 | 21.774 |
| 13.5264 | 21.917 |
| 13.543 | 21.884 |
| 13.5603 | 21.885 |
| 13.6356 | 21.848 |
| 13.6476 | 21.971 |
| 13.6827 | 21.974 |
| 13.6912 | 21.958 |
| 13.7768 | 22.132 |
| 13.8249 | 22.155 |
| 13.8979 | 22.283 |
| 14.381 | 21.478 |
| 14.4455 | 21.22 |
| 14.6305 | 20.612 |
| 14.709 | 20.672 |
| 14.6535 | 20.656 |
| 14.8664 | 20.528 |
| 14.8889 | 20.486 |
| 14.7968 | 20.785 |
| 15.0876 | 20.723 |
| 14.7649 | 21.198 |
| 15.4136 | 21.623 |
| 15.7053 | 21.57 |
| 15.5068 | 21.831 |
| 15.0902 | 21.982 |
| 14.6483 | 22.27 |
| 15.2037 | 22.104 |
| 15.5699 | 22.03 |
| 14.8991 | 22.373 |
| 16.088 | 21.201 |
| 15.1541 | 22.139 |
| 14.6994 | 22.274 |
| 15.0076 | 22.127 |
| 14.8187 | 22.211 |
| 15.4055 | 21.564 |
| 15.3844 | 20.913 |
| 15.1819 | 20.909 |
| 14.9218 | 20.91 |
| 14.5528 | 21.331 |
| 14.4867 | 21.379 |
| 14.1301 | 21.959 |
| 14.0588 | 21.907 |
| 14.017 | 21.86 |
| 13.9561 | 21.83 |
| 13.9217 | 21.834 |
| 13.822 | 21.923 |
| 13.7899 | 21.965 |
| 13.7781 | 22.084 |
| 13.7447 | 22.211 |
| 13.7285 | 22.5 |
| 13.8204 | 22.587 |
| 13.8634 | 22.521 |
| 13.8949 | 22.408 |
| 13.8978 | 22.4 |
| 13.8575 | 22.303 |
| 13.8441 | 22.296 |
| 13.8836 | 22.389 |
| 13.7473 | 22.34 |
| 13.8346 | 21.916 |
| 13.9064 | 21.841 |
| 13.9813 | 21.866 |
| 13.97 | 21.861 |
| 14.0352 | 21.887 |
| 14.4848 | 22.078 |
| 14.6213 | 22.18 |
| 14.6758 | 22.165 |
| 15.2955 | 21.954 |
| 16.093 | 21.488 |
| 15.9579 | 21.272 |
| 15.5662 | 21.168 |
| 15.3969 | 21.07 |
| 15.5347 | 20.929 |
| 15.2648 | 21.126 |
| 15.3004 | 21.17 |
| 15.3911 | 21.159 |
| 15.5056 | 21.337 |
| 15.3191 | 21.176 |
| 15.3768 | 21.12 |
| 15.2469 | 21.286 |
| 15.0689 | 21.618 |
| 14.8655 | 21.903 |
| 14.7269 | 22.041 |
| 14.6585 | 22.309 |
| 14.5769 | 22.34 |
| 14.5073 | 22.355 |
| 14.5362 | 22.294 |
| 14.6648 | 22.119 |
| 14.5586 | 22.19 |
| 14.4149 | 22.216 |
| 14.5319 | 22.038 |
| 14.4257 | 22.051 |
| 14.4451 | 22.008 |
| 14.4083 | 21.796 |
| 14.3957 | 21.626 |
| 14.2703 | 21.69 |
| 14.2339 | 21.797 |
| 14.2052 | 21.875 |
| 14.1931 | 21.817 |
| 14.2079 | 21.632 |
| 14.1419 | 21.858 |
| 14.1471 | 21.738 |
| 14.1358 | 21.823 |
| 14.1455 | 21.78 |
| 14.1462 | 21.94 |
| 14.1323 | 21.947 |
| 14.1355 | 21.953 |
| 14.1528 | 21.918 |
| 14.194 | 21.884 |
| 14.216 | 21.897 |
| 14.2874 | 21.915 |
| 14.3068 | 21.988 |
| 14.2932 | 21.916 |
| 14.4728 | 22.266 |
| 14.5995 | 22.238 |
| 14.6996 | 22.281 |
| 15.0874 | 22.387 |
| 15.6867 | 22.383 |
| 15.7898 | 22.256 |
| 15.6099 | 22.201 |
| 15.3035 | 21.679 |
| 15.3247 | 21.637 |
| 15.3011 | 21.163 |
| 15.346 | 20.821 |
| 15.4053 | 20.609 |
| 15.4047 | 20.9 |
| 15.0917 | 21.909 |
| 15.1864 | 21.65 |
| 14.7351 | 22.23 |
| 14.8826 | 22.284 |
| 14.9214 | 22.174 |
| 14.9791 | 22.149 |
| 14.827 | 22.184 |
| 14.6695 | 22.229 |
| 14.602 | 22.251 |
| 14.6944 | 22.16 |
| 14.8733 | 21.374 |
| 14.7951 | 21.263 |
| 14.4781 | 21.984 |
| 14.7549 | 21.427 |
| 14.5884 | 21.469 |
| 14.2448 | 22.022 |
| 14.1562 | 22.17 |
| 14.1361 | 22.109 |
| 13.9853 | 22.62 |
| 14.0062 | 22.541 |
| 13.9772 | 22.544 |
| 14.0055 | 22.345 |
| 14.0033 | 22.29 |
| 13.903 | 22.647 |
| 13.9423 | 22.476 |
| 13.9191 | 22.544 |
| 13.9584 | 22.375 |
| 13.9453 | 22.451 |
| 13.9507 | 22.468 |
| 13.9446 | 22.473 |
| 13.9103 | 22.568 |
| 13.898 | 22.588 |
| 14.2201 | 22.433 |
| 13.9251 | 22.536 |
| 14.1417 | 22.44 |
| 14.4179 | 22.308 |
| 14.4265 | 22.316 |
| 14.6105 | 22.265 |
| 14.6683 | 22.214 |
| 15.1656 | 22.135 |
| 15.512 | 22.245 |
| 15.3745 | 22.194 |
| 15.3149 | 22.003 |
| 15.2942 | 21.734 |
| 15.1382 | 21.71 |
| 15.0984 | 21.658 |
| 15.1297 | 21.358 |
| 15.0906 | 21.337 |
| 15.2705 | 20.805 |
| 15.2756 | 20.699 |
| 15.2353 | 20.685 |
| 15.2138 | 20.629 |
| 15.2076 | 20.508 |
| 15.1967 | 20.31 |
| 15.0177 | 21.521 |
| 15.0477 | 21.702 |
| 14.8818 | 21.771 |
| 14.9208 | 21.669 |
| 14.8084 | 21.642 |
| 14.6911 | 21.895 |
| 14.7574 | 21.98 |
| 14.7564 | 22.26 |
| 14.6707 | 21.965 |
| 14.5654 | 22.102 |
| 14.3542 | 22.199 |
| 14.4201 | 22.132 |
| 14.6538 | 21.646 |
| 14.5402 | 21.875 |
| 14.497 | 21.355 |
| 14.4348 | 21.298 |
| 14.3666 | 21.755 |
| 14.3373 | 21.65 |
| 14.3226 | 21.62 |
| 14.2979 | 21.59 |
| 14.3104 | 21.264 |
| 14.3147 | 21.25 |
| 14.3018 | 21.347 |
| 14.3411 | 21.256 |
| 14.4054 | 21.184 |
| 14.4141 | 21.194 |
| 14.4191 | 21.19 |
| 14.5011 | 21.257 |
| 14.6674 | 21.314 |
| 14.4834 | 21.6 |
| 14.5045 | 21.556 |
| 14.5514 | 21.676 |
| 14.7474 | 21.773 |
| 14.8516 | 21.887 |
| 15.2898 | 22.03 |
| 15.32 | 22.049 |
| 15.5848 | 22.022 |
| 15.6335 | 21.952 |
| 15.8775 | 21.909 |
| 15.7892 | 21.952 |
| 16.029 | 21.883 |
| 15.8656 | 21.931 |
| 16.1397 | 22.008 |
| 15.7412 | 21.878 |
| 15.9424 | 21.96 |
| 15.9172 | 22.042 |
| 15.7868 | 22.122 |
| 15.4942 | 22.167 |
| 15.4321 | 22.179 |
| 16.0425 | 22.047 |
| 16.0451 | 22.069 |
| 15.8136 | 22.099 |
| 15.1864 | 22.003 |
| 15.4134 | 21.873 |
| 15.2451 | 21.967 |
| 15.5148 | 21.683 |
| 15.6387 | 21.364 |
| 15.3433 | 21.38 |
| 15.1705 | 21.575 |
| 14.9649 | 21.848 |
| 14.7549 | 21.858 |
| 14.6046 | 21.797 |
| 14.5692 | 21.728 |
| 14.511 | 21.68 |
| 14.491 | 21.622 |
| 14.4758 | 21.619 |
| 14.4253 | 21.985 |
| 14.3682 | 22.239 |
| 14.3276 | 22.493 |
| 14.3073 | 22.564 |
| 14.3229 | 22.581 |
| 14.3642 | 22.596 |
| 14.3533 | 22.621 |
| 14.2823 | 22.352 |
| 14.2655 | 22.292 |
| 14.2175 | 22.268 |
| 14.288 | 22.476 |
| 14.2492 | 21.708 |
| 14.3304 | 21.775 |
| 14.5274 | 21.84 |
| 14.7369 | 21.839 |
| 14.7824 | 21.796 |
| 15.1528 | 21.995 |
| 15.2898 | 21.998 |
| 15.961 | 21.704 |
| 16.1713 | 21.244 |
| 15.6176 | 21.368 |
| 15.9026 | 21.425 |
| 16.0892 | 21.386 |
| 15.858 | 21.324 |
| 15.7071 | 21.354 |
| 16.025 | 21.364 |
| 16.03 | 21.035 |
| 15.986 | 21.192 |
| 15.8955 | 20.997 |
| 15.7359 | 21.381 |
| 15.7556 | 21.155 |
| 15.8461 | 20.807 |
| 15.7529 | 20.904 |
| 15.5339 | 21.558 |
| 15.6497 | 21.649 |
| 15.7129 | 21.603 |
| 15.6626 | 22.024 |
| 15.3476 | 22.031 |
| 15.2762 | 21.956 |
| 15.3566 | 21.858 |
| 15.2678 | 22.01 |
| 15.1744 | 22.028 |
| 15.1183 | 22.077 |
| 15.1043 | 22.032 |
| 15.1811 | 21.342 |
| 15.1228 | 21.734 |
| 15.0463 | 21.972 |
| 15.0224 | 21.235 |
| 14.9434 | 21.622 |
| 14.8787 | 21.665 |
| 14.8822 | 21.601 |
| 14.8651 | 21.606 |
| 14.8392 | 21.653 |
| 14.7804 | 21.71 |
| 14.7284 | 21.766 |
| 14.6704 | 21.822 |
| 14.5496 | 22.015 |
| 14.564 | 22.094 |
| 14.4874 | 22.225 |
| 14.5266 | 22.172 |
| 14.5438 | 22.184 |
| 14.6719 | 22.051 |
| 14.6934 | 22.029 |
| 14.701 | 21.967 |
| 15.1094 | 21.727 |
| 15.2399 | 21.632 |
| 15.3882 | 21.721 |
| 15.3636 | 21.742 |
| 15.5695 | 21.777 |
| 15.5742 | 21.732 |
| 15.6704 | 21.748 |
| 16.1659 | 21.882 |
| 16.0967 | 21.65 |